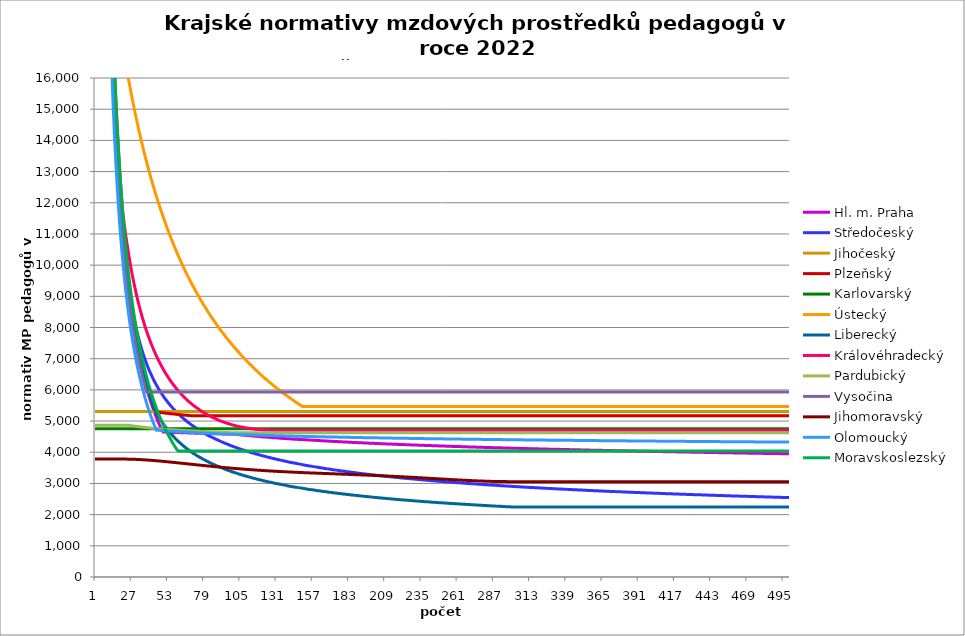
| Category | Hl. m. Praha | Středočeský | Jihočeský | Plzeňský | Karlovarský  | Ústecký   | Liberecký | Královéhradecký | Pardubický | Vysočina | Jihomoravský | Olomoucký | Moravskoslezský |
|---|---|---|---|---|---|---|---|---|---|---|---|---|---|
| 0 | 230520 | 235026 | 5305.814 | 235260 | 4750 | 207714 | 235200 | 244560 | 4866.689 | 32207.143 | 3780.621 | 211968 | 244200 |
| 1 | 115260 | 117513 | 5305.814 | 117630 | 4750 | 103857 | 117600 | 122280 | 4866.689 | 32207.143 | 3780.621 | 105984 | 122100 |
| 2 | 76840 | 78342 | 5305.814 | 78420 | 4750 | 69238 | 78400 | 81520 | 4866.689 | 32207.143 | 3780.621 | 70656 | 81400 |
| 3 | 57630 | 58756.5 | 5305.814 | 58815 | 4750 | 51928.5 | 58800 | 61140 | 4866.689 | 32207.143 | 3780.621 | 52992 | 61050 |
| 4 | 46104 | 47005.2 | 5305.814 | 47052 | 4750 | 41542.8 | 47040 | 48912 | 4866.689 | 32207.143 | 3780.621 | 42393.6 | 48840 |
| 5 | 38420 | 39171 | 5305.814 | 39210 | 4750 | 34619 | 39200 | 40760 | 4866.689 | 32207.143 | 3780.621 | 35328 | 40700 |
| 6 | 32931.429 | 33575.143 | 5305.814 | 33608.571 | 4750 | 29673.429 | 33600 | 34937.143 | 4866.689 | 32207.143 | 3780.621 | 30281.143 | 34885.714 |
| 7 | 28815 | 29378.25 | 5305.814 | 29407.5 | 4750 | 25964.25 | 29400 | 30570 | 4866.689 | 28181.25 | 3780.621 | 26496 | 30525 |
| 8 | 25613.333 | 26114 | 5305.814 | 26140 | 4750 | 23079.333 | 26133.333 | 27173.333 | 4866.689 | 25050 | 3780.621 | 23552 | 27133.333 |
| 9 | 23052 | 23502.6 | 5305.814 | 23526 | 4750 | 20771.4 | 23520 | 24456 | 4866.689 | 22545 | 3780.621 | 21196.8 | 24420 |
| 10 | 20956.364 | 21366 | 5305.814 | 21387.273 | 4750 | 20364.118 | 21381.818 | 22232.727 | 4866.689 | 20495.455 | 3780.621 | 19269.818 | 22200 |
| 11 | 19210 | 19585.5 | 5305.814 | 19605 | 4750 | 19972.5 | 19600 | 20380 | 4866.689 | 18787.5 | 3780.621 | 17664 | 20350 |
| 12 | 17732.308 | 18078.923 | 5305.814 | 18096.923 | 4750 | 19595.66 | 18092.308 | 18812.308 | 4866.689 | 17342.308 | 3780.621 | 16305.231 | 18784.615 |
| 13 | 16465.714 | 16787.571 | 5305.814 | 16804.286 | 4750 | 19232.778 | 16800 | 17468.571 | 4866.689 | 16103.571 | 3780.621 | 15140.571 | 17442.857 |
| 14 | 15368 | 15668.4 | 5305.814 | 15684 | 4750 | 18883.091 | 15680 | 16304 | 4866.689 | 15030 | 3780.621 | 14131.2 | 16280 |
| 15 | 14407.5 | 14689.125 | 5305.814 | 14703.75 | 4750 | 18545.893 | 14700 | 15285 | 4866.689 | 14090.625 | 3780.621 | 13248 | 15262.5 |
| 16 | 13560 | 13825.059 | 5305.814 | 13838.824 | 4750 | 18220.526 | 13835.294 | 14385.882 | 4866.689 | 13261.765 | 3780.621 | 12468.706 | 14364.706 |
| 17 | 12806.667 | 13057 | 5305.814 | 13070 | 4750 | 17906.379 | 13066.667 | 13586.667 | 4866.689 | 12525 | 3780.621 | 11776 | 13566.667 |
| 18 | 12132.632 | 12369.789 | 5305.814 | 12382.105 | 4750 | 17602.881 | 12378.947 | 12871.579 | 4866.689 | 11865.789 | 3780.621 | 11156.211 | 12852.632 |
| 19 | 11526 | 11807.992 | 5305.814 | 11763 | 4750 | 17309.5 | 11760 | 12228 | 4866.689 | 11272.5 | 3780.621 | 10598.4 | 12210 |
| 20 | 10977.143 | 11190.779 | 5305.814 | 11202.857 | 4750 | 17025.738 | 11200 | 11662.375 | 4866.689 | 10735.714 | 3780.621 | 10093.714 | 11628.571 |
| 21 | 10478.182 | 10659.522 | 5305.814 | 10693.636 | 4750 | 16751.129 | 10690.909 | 11309.133 | 4866.689 | 10247.727 | 3780.621 | 9634.909 | 11100 |
| 22 | 10022.609 | 10196.966 | 5305.814 | 10228.696 | 4750 | 16485.238 | 10226.087 | 10979.125 | 4866.689 | 9802.174 | 3780.306 | 9216 | 10617.391 |
| 23 | 9605 | 9790.216 | 5305.814 | 9802.5 | 4750 | 16227.656 | 9800 | 10674.814 | 4866.689 | 9393.75 | 3779.674 | 8832 | 10175 |
| 24 | 9220.8 | 9429.439 | 5305.814 | 9410.4 | 4750 | 15978 | 9408 | 10386.919 | 4866.689 | 9018 | 3779.043 | 8478.72 | 9768 |
| 25 | 8866.154 | 9107.003 | 5305.814 | 9048.462 | 4750 | 15735.909 | 9046.154 | 10120.422 | 4859.347 | 8671.154 | 3778.097 | 8152.615 | 9392.308 |
| 26 | 8537.778 | 8816.893 | 5305.814 | 8713.333 | 4750 | 15501.045 | 8711.111 | 9869.249 | 4852.43 | 8350 | 3776.836 | 7850.667 | 9044.444 |
| 27 | 8232.857 | 8554.301 | 5305.814 | 8402.143 | 4750 | 15273.088 | 8400 | 9634.036 | 4845.783 | 8051.786 | 3775.576 | 7570.286 | 8721.429 |
| 28 | 7948.966 | 8315.338 | 5305.814 | 8112.414 | 4750 | 15051.739 | 8110.345 | 9411.584 | 4839.386 | 7774.138 | 3774.002 | 7309.241 | 8420.69 |
| 29 | 7684 | 8096.823 | 5305.814 | 7842 | 4750 | 14836.714 | 7840 | 9204.366 | 4833.222 | 7515 | 3772.114 | 7065.6 | 8140 |
| 30 | 7436.129 | 7896.129 | 5305.814 | 7589.032 | 4750 | 14627.746 | 7587.097 | 9006.076 | 4827.276 | 7272.581 | 3770.229 | 6837.677 | 7877.419 |
| 31 | 7203.75 | 7711.065 | 5305.814 | 7351.875 | 4750 | 14424.583 | 7350 | 8820.92 | 4821.532 | 7045.312 | 3768.032 | 6624 | 7631.25 |
| 32 | 6985.455 | 7539.791 | 5305.814 | 7129.091 | 4750 | 14226.986 | 7127.273 | 8644.751 | 4815.978 | 6831.818 | 3765.837 | 6423.273 | 7400 |
| 33 | 6780 | 7380.749 | 5305.814 | 6919.412 | 4750 | 14034.73 | 6917.647 | 8476.95 | 4810.602 | 6630.882 | 3763.333 | 6234.353 | 7182.353 |
| 34 | 6586.286 | 7232.608 | 5305.814 | 6721.714 | 4750 | 13847.6 | 6720 | 8318.367 | 4805.393 | 6441.429 | 3760.831 | 6056.229 | 6977.143 |
| 35 | 6403.333 | 7094.23 | 5305.814 | 6535 | 4750 | 13665.395 | 6533.333 | 8168.337 | 4800.342 | 6262.5 | 3758.021 | 5888 | 6783.333 |
| 36 | 6230.27 | 6964.63 | 5305.814 | 6358.378 | 4750 | 13487.922 | 6356.757 | 8024.938 | 4795.439 | 6093.243 | 3755.214 | 5728.865 | 6600 |
| 37 | 6066.316 | 6842.955 | 5305.814 | 6191.053 | 4750 | 13315 | 6189.474 | 7889.032 | 4790.677 | 5932.895 | 3752.101 | 5578.105 | 6426.316 |
| 38 | 5910.769 | 6728.459 | 5305.814 | 6032.308 | 4750 | 13146.456 | 6030.769 | 7760.114 | 4786.047 | 5932.895 | 3748.994 | 5435.077 | 6261.538 |
| 39 | 5763 | 6620.49 | 5305.814 | 5881.5 | 4750 | 12982.125 | 5880 | 7636.534 | 4781.544 | 5932.895 | 3745.581 | 5299.2 | 6105 |
| 40 | 5622.439 | 6518.474 | 5305.814 | 5738.049 | 4750 | 12821.852 | 5736.585 | 7517.983 | 4777.159 | 5932.895 | 3742.174 | 5169.951 | 5956.098 |
| 41 | 5488.571 | 6421.902 | 5305.814 | 5601.429 | 4750 | 12665.488 | 5600 | 7405.299 | 4772.888 | 5932.895 | 3738.774 | 5046.857 | 5814.286 |
| 42 | 5360.93 | 6330.325 | 5305.814 | 5471.163 | 4750 | 12512.892 | 5469.767 | 7298.12 | 4768.725 | 5932.895 | 3735.072 | 4929.488 | 5679.07 |
| 43 | 5239.091 | 6243.341 | 5305.814 | 5346.818 | 4750 | 12363.929 | 5363.391 | 7195.057 | 4764.665 | 5932.895 | 3731.377 | 4817.455 | 5550 |
| 44 | 5122.667 | 6160.592 | 5305.814 | 5293.284 | 4750 | 12218.471 | 5277.689 | 7096.924 | 4760.703 | 5932.895 | 3727.689 | 4710.4 | 5426.667 |
| 45 | 5011.304 | 6081.756 | 5305.814 | 5287.336 | 4750 | 12076.395 | 5196.479 | 7002.434 | 4756.834 | 5932.895 | 3723.702 | 4706.739 | 5308.696 |
| 46 | 4904.681 | 6006.544 | 5305.814 | 5280.808 | 4750 | 11937.586 | 5119.399 | 6911.403 | 4753.054 | 5932.895 | 3719.724 | 4703.084 | 5195.745 |
| 47 | 4802.5 | 5934.697 | 5305.814 | 5274.888 | 4750 | 11801.932 | 5046.125 | 6824.613 | 4749.36 | 5932.895 | 3715.754 | 4699.435 | 5087.5 |
| 48 | 4704.49 | 5865.977 | 5305.814 | 5269.571 | 4750 | 11669.326 | 4976.367 | 6741.833 | 4745.747 | 5932.895 | 3711.488 | 4695.791 | 4983.673 |
| 49 | 4651.801 | 5800.173 | 5305.814 | 5263.676 | 4750 | 11539.667 | 4909.865 | 6661.945 | 4742.213 | 5932.895 | 3707.536 | 4692.153 | 4884 |
| 50 | 4649.924 | 5737.088 | 5305.814 | 5258.382 | 4750 | 11412.857 | 4846.381 | 6584.814 | 4738.754 | 5932.895 | 3703.289 | 4688.52 | 4788.235 |
| 51 | 4648.049 | 5676.547 | 5305.814 | 5253.098 | 4750 | 11288.804 | 4785.705 | 6511.182 | 4735.367 | 5932.895 | 3698.75 | 4685.411 | 4696.154 |
| 52 | 4646.176 | 5618.388 | 5305.814 | 5247.825 | 4750 | 11167.419 | 4727.643 | 6440.026 | 4732.049 | 5932.895 | 3694.523 | 4682.306 | 4607.547 |
| 53 | 4643.836 | 5562.464 | 5305.814 | 5242.563 | 4750 | 11048.617 | 4672.019 | 6372.069 | 4728.798 | 5932.895 | 3690.005 | 4678.689 | 4522.222 |
| 54 | 4641.965 | 5508.637 | 5305.814 | 5237.894 | 4750 | 10932.316 | 4618.675 | 6306.343 | 4725.611 | 5932.895 | 3685.498 | 4675.593 | 4440 |
| 55 | 4640.097 | 5456.785 | 5305.814 | 5232.651 | 4750 | 10818.437 | 4567.464 | 6243.554 | 4722.485 | 5932.895 | 3681.002 | 4672.501 | 4360.714 |
| 56 | 4638.696 | 5406.793 | 5305.814 | 5228 | 4750 | 10706.907 | 4518.254 | 6182.002 | 4719.419 | 5932.895 | 3676.517 | 4669.413 | 4284.211 |
| 57 | 4636.83 | 5358.554 | 5305.814 | 5223.357 | 4750 | 10597.653 | 4470.921 | 6123.951 | 4716.41 | 5932.895 | 3672.043 | 4666.843 | 4210.345 |
| 58 | 4634.965 | 5311.971 | 5305.814 | 5218.722 | 4750 | 10490.606 | 4425.354 | 6066.981 | 4713.456 | 5932.895 | 3667.282 | 4663.762 | 4138.983 |
| 59 | 4633.102 | 5266.954 | 5305.814 | 5214.096 | 4750 | 10385.7 | 4381.45 | 6012.538 | 4710.555 | 5932.895 | 3662.831 | 4660.686 | 4070 |
| 60 | 4631.706 | 5223.42 | 5305.814 | 5209.477 | 4750 | 10282.871 | 4339.113 | 5960.517 | 4707.706 | 5932.895 | 3658.094 | 4658.125 | 4040.705 |
| 61 | 4629.845 | 5181.289 | 5305.814 | 5204.867 | 4750 | 10182.059 | 4298.255 | 5910.101 | 4704.906 | 5932.895 | 3653.37 | 4655.057 | 4040.705 |
| 62 | 4628.451 | 5140.491 | 5305.814 | 5200.84 | 4750 | 10083.204 | 4258.795 | 5861.234 | 4702.155 | 5932.895 | 3648.658 | 4652.502 | 4040.705 |
| 63 | 4626.593 | 5100.959 | 5305.814 | 5196.245 | 4750 | 9986.25 | 4220.657 | 5813.86 | 4699.45 | 5932.895 | 3643.958 | 4649.951 | 4040.705 |
| 64 | 4625.201 | 5062.628 | 5305.814 | 5192.231 | 4750 | 9891.143 | 4183.772 | 5768.605 | 4696.79 | 5932.895 | 3639.27 | 4647.402 | 4040.705 |
| 65 | 4623.345 | 5025.442 | 5305.814 | 5188.224 | 4750 | 9797.83 | 4148.076 | 5724.719 | 4694.173 | 5932.895 | 3634.594 | 4644.347 | 4040.705 |
| 66 | 4621.955 | 4989.345 | 5305.814 | 5184.222 | 4750 | 9706.262 | 4113.506 | 5682.156 | 4691.599 | 5932.895 | 3629.93 | 4641.804 | 4040.705 |
| 67 | 4620.565 | 4954.286 | 5305.814 | 5180.227 | 4750 | 9616.389 | 4080.007 | 5641.522 | 4689.065 | 5932.895 | 3625.278 | 4639.772 | 4040.705 |
| 68 | 4618.714 | 4920.218 | 5305.814 | 5176.238 | 4750 | 9528.165 | 4047.527 | 5602.107 | 4686.572 | 5932.895 | 3620.638 | 4637.235 | 4040.705 |
| 69 | 4617.326 | 4887.095 | 5305.814 | 5172.255 | 4750 | 9441.545 | 4016.017 | 5563.872 | 4684.116 | 5932.895 | 3615.721 | 4634.7 | 4040.705 |
| 70 | 4615.939 | 4854.876 | 5305.814 | 5170.549 | 4750 | 9356.486 | 3985.429 | 5526.78 | 4681.699 | 5932.895 | 3611.106 | 4632.168 | 4040.705 |
| 71 | 4614.553 | 4823.521 | 5305.814 | 5170.549 | 4750 | 9272.946 | 3955.723 | 5491.411 | 4679.317 | 5932.895 | 3606.502 | 4629.639 | 4040.705 |
| 72 | 4613.168 | 4792.992 | 5305.814 | 5170.549 | 4750 | 9190.885 | 3926.857 | 5457.101 | 4676.97 | 5932.895 | 3601.623 | 4627.617 | 4040.705 |
| 73 | 4611.784 | 4763.255 | 5305.814 | 5170.549 | 4750 | 9110.263 | 3898.793 | 5423.819 | 4674.658 | 5932.895 | 3597.044 | 4625.093 | 4040.705 |
| 74 | 4610.4 | 4734.277 | 5305.814 | 5170.549 | 4750 | 9031.043 | 3871.497 | 5392.129 | 4672.379 | 5932.895 | 3592.476 | 4623.075 | 4040.705 |
| 75 | 4609.017 | 4706.026 | 5305.814 | 5170.549 | 4750 | 8953.19 | 3844.934 | 5360.807 | 4670.133 | 5932.895 | 3587.635 | 4620.556 | 4040.705 |
| 76 | 4607.635 | 4678.473 | 5305.814 | 5170.549 | 4750 | 8876.667 | 3819.073 | 5331.008 | 4667.918 | 5932.895 | 3583.091 | 4618.542 | 4040.705 |
| 77 | 4606.715 | 4651.59 | 5305.814 | 5170.549 | 4750 | 8801.441 | 3793.885 | 5302.114 | 4665.733 | 5932.895 | 3578.558 | 4616.531 | 4040.705 |
| 78 | 4605.334 | 4625.351 | 5305.814 | 5170.549 | 4750 | 8727.479 | 3769.341 | 5274.1 | 4663.579 | 5932.895 | 3574.037 | 4614.521 | 4040.705 |
| 79 | 4603.954 | 4599.731 | 5305.814 | 5170.549 | 4750 | 8654.75 | 3745.416 | 5247.506 | 4661.453 | 5932.895 | 3569.527 | 4612.01 | 4040.705 |
| 80 | 4602.576 | 4574.706 | 5305.814 | 5170.549 | 4750 | 8583.223 | 3722.085 | 5221.178 | 4659.356 | 5932.895 | 3565.028 | 4610.004 | 4040.705 |
| 81 | 4601.657 | 4550.254 | 5305.814 | 5170.549 | 4750 | 8512.869 | 3699.323 | 5196.218 | 4657.286 | 5932.895 | 3560.541 | 4608 | 4040.705 |
| 82 | 4600.279 | 4526.354 | 5305.814 | 5170.549 | 4750 | 8443.659 | 3677.109 | 5172.042 | 4655.243 | 5932.895 | 3556.065 | 4605.997 | 4040.705 |
| 83 | 4598.903 | 4502.985 | 5305.814 | 5170.549 | 4750 | 8375.565 | 3655.421 | 5148.632 | 4653.227 | 5932.895 | 3551.601 | 4603.997 | 4040.705 |
| 84 | 4597.985 | 4480.129 | 5305.814 | 5170.549 | 4750 | 8308.56 | 3634.24 | 5126.507 | 4651.236 | 5932.895 | 3547.147 | 4601.997 | 4040.705 |
| 85 | 4596.61 | 4457.767 | 5305.814 | 5170.549 | 4750 | 8242.619 | 3613.546 | 5104.571 | 4649.27 | 5932.895 | 3542.705 | 4600 | 4040.705 |
| 86 | 4595.694 | 4435.881 | 5305.814 | 5170.549 | 4750 | 8177.717 | 3593.322 | 5083.351 | 4647.328 | 5932.895 | 3538.551 | 4598.004 | 4040.705 |
| 87 | 4594.32 | 4414.456 | 5305.814 | 5170.549 | 4750 | 8113.828 | 3573.551 | 5063.354 | 4645.41 | 5932.895 | 3534.13 | 4596.509 | 4040.705 |
| 88 | 4592.947 | 4393.476 | 5305.814 | 5170.549 | 4750 | 8050.93 | 3554.215 | 5044.034 | 4643.516 | 5932.895 | 3529.995 | 4594.516 | 4040.705 |
| 89 | 4592.032 | 4372.925 | 5305.814 | 5170.549 | 4750 | 7989 | 3535.3 | 5024.861 | 4641.644 | 5932.895 | 3525.596 | 4592.525 | 4040.705 |
| 90 | 4591.117 | 4352.79 | 5305.814 | 5170.549 | 4750 | 7928.015 | 3516.792 | 5006.858 | 4639.794 | 5932.895 | 3521.481 | 4590.536 | 4040.705 |
| 91 | 4589.746 | 4333.056 | 5305.814 | 5170.549 | 4750 | 7867.955 | 3498.675 | 4989.493 | 4637.966 | 5932.895 | 3517.376 | 4589.045 | 4040.705 |
| 92 | 4588.832 | 4313.711 | 5305.814 | 5170.549 | 4750 | 7808.797 | 3480.937 | 4972.753 | 4636.159 | 5932.895 | 3513.281 | 4587.059 | 4040.705 |
| 93 | 4587.463 | 4294.741 | 5305.814 | 5170.549 | 4750 | 7750.522 | 3463.564 | 4956.627 | 4634.373 | 5932.895 | 3509.195 | 4585.571 | 4040.705 |
| 94 | 4586.55 | 4276.137 | 5305.814 | 5170.549 | 4750 | 7693.111 | 3446.545 | 4941.604 | 4632.607 | 5932.895 | 3505.119 | 4583.587 | 4040.705 |
| 95 | 4585.638 | 4257.884 | 5305.814 | 5170.549 | 4750 | 7636.544 | 3429.869 | 4926.672 | 4630.86 | 5932.895 | 3501.323 | 4582.101 | 4040.705 |
| 96 | 4584.726 | 4239.974 | 5305.814 | 5170.549 | 4750 | 7580.803 | 3413.523 | 4912.323 | 4629.134 | 5932.895 | 3497.265 | 4580.121 | 4040.705 |
| 97 | 4583.358 | 4222.396 | 5305.814 | 5170.549 | 4750 | 7525.87 | 3397.497 | 4898.548 | 4627.426 | 5932.895 | 3493.486 | 4578.637 | 4040.705 |
| 98 | 4582.447 | 4205.138 | 5305.814 | 5170.549 | 4750 | 7471.727 | 3381.782 | 4885.338 | 4625.737 | 5932.895 | 3489.446 | 4576.66 | 4040.705 |
| 99 | 4580.626 | 4188.193 | 5305.814 | 5170.549 | 4750 | 7418.357 | 3366.367 | 4873.169 | 4624.066 | 5932.895 | 3485.683 | 4575.178 | 4040.705 |
| 100 | 4576.079 | 4171.55 | 5305.814 | 5170.549 | 4750 | 7365.745 | 3351.244 | 4861.061 | 4624.066 | 5932.895 | 3481.929 | 4573.697 | 4040.705 |
| 101 | 4571.542 | 4155.201 | 5305.814 | 5170.549 | 4750 | 7313.873 | 3336.402 | 4849.494 | 4624.066 | 5932.895 | 3478.183 | 4571.724 | 4040.705 |
| 102 | 4567.013 | 4139.137 | 5305.814 | 5170.549 | 4750 | 7262.727 | 3321.835 | 4838.461 | 4624.066 | 5932.895 | 3474.712 | 4570.246 | 4040.705 |
| 103 | 4562.945 | 4123.35 | 5305.814 | 5170.549 | 4750 | 7212.292 | 3307.533 | 4827.954 | 4624.066 | 5932.895 | 3470.982 | 4568.768 | 4040.705 |
| 104 | 4558.434 | 4107.833 | 5305.814 | 5170.549 | 4750 | 7162.552 | 3293.489 | 4817.967 | 4624.066 | 5932.895 | 3467.525 | 4567.292 | 4040.705 |
| 105 | 4554.381 | 4092.577 | 5305.814 | 5170.549 | 4750 | 7113.493 | 3279.695 | 4808.967 | 4624.066 | 5932.895 | 3463.81 | 4565.816 | 4040.705 |
| 106 | 4549.887 | 4077.577 | 5305.814 | 5170.549 | 4750 | 7065.102 | 3266.144 | 4800 | 4624.066 | 5932.895 | 3460.367 | 4564.341 | 4040.705 |
| 107 | 4545.849 | 4062.823 | 5305.814 | 5170.549 | 4750 | 7017.365 | 3252.829 | 4791.536 | 4624.066 | 5932.895 | 3456.931 | 4562.376 | 4040.705 |
| 108 | 4541.819 | 4048.311 | 5305.814 | 5170.549 | 4750 | 6970.268 | 3239.743 | 4783.102 | 4624.066 | 5932.895 | 3453.502 | 4560.904 | 4040.705 |
| 109 | 4537.795 | 4034.033 | 5305.814 | 5170.549 | 4750 | 6923.8 | 3226.88 | 4775.63 | 4624.066 | 5932.895 | 3450.08 | 4559.432 | 4040.705 |
| 110 | 4533.333 | 4019.983 | 5305.814 | 5170.549 | 4750 | 6877.947 | 3214.234 | 4768.646 | 4624.066 | 5932.895 | 3446.927 | 4557.962 | 4040.705 |
| 111 | 4529.77 | 4006.155 | 5305.814 | 5170.549 | 4750 | 6832.697 | 3201.799 | 4761.682 | 4624.066 | 5932.895 | 3443.518 | 4556.492 | 4040.705 |
| 112 | 4525.768 | 3992.544 | 5305.814 | 5170.549 | 4750 | 6788.039 | 3189.569 | 4755.664 | 4624.066 | 5932.895 | 3440.377 | 4555.023 | 4040.705 |
| 113 | 4521.773 | 3979.144 | 5305.814 | 5170.549 | 4750 | 6743.961 | 3177.539 | 4749.66 | 4624.066 | 5932.895 | 3437.242 | 4553.555 | 4040.705 |
| 114 | 4517.785 | 3965.949 | 5305.814 | 5170.549 | 4750 | 6700.452 | 3165.703 | 4744.132 | 4624.066 | 5932.895 | 3434.112 | 4552.577 | 4040.705 |
| 115 | 4513.805 | 3952.955 | 5305.814 | 5170.549 | 4750 | 6657.5 | 3154.056 | 4739.076 | 4624.066 | 5932.895 | 3430.988 | 4551.111 | 4040.705 |
| 116 | 4510.272 | 3940.156 | 5305.814 | 5170.549 | 4750 | 6615.096 | 3142.593 | 4734.488 | 4624.066 | 5932.895 | 3427.87 | 4549.646 | 4040.705 |
| 117 | 4506.304 | 3927.547 | 5305.814 | 5170.549 | 4750 | 6573.228 | 3131.31 | 4730.368 | 4624.066 | 5932.895 | 3424.758 | 4548.182 | 4040.705 |
| 118 | 4502.783 | 3915.124 | 5305.814 | 5170.549 | 4750 | 6531.887 | 3120.202 | 4726.71 | 4624.066 | 5932.895 | 3421.91 | 4546.718 | 4040.705 |
| 119 | 4499.268 | 3902.883 | 5305.814 | 5170.549 | 4750 | 6491.062 | 3109.265 | 4723.059 | 4624.066 | 5932.895 | 3419.066 | 4545.256 | 4040.705 |
| 120 | 4495.32 | 3890.818 | 5305.814 | 5170.549 | 4750 | 6450.745 | 3098.493 | 4719.869 | 4624.066 | 5932.895 | 3416.228 | 4544.281 | 4040.705 |
| 121 | 4491.816 | 3878.927 | 5305.814 | 5170.549 | 4750 | 6410.926 | 3087.884 | 4717.138 | 4624.066 | 5932.895 | 3413.394 | 4542.82 | 4040.705 |
| 122 | 4488.318 | 3867.204 | 5305.814 | 5170.549 | 4750 | 6371.595 | 3077.433 | 4714.864 | 4624.066 | 5932.895 | 3410.564 | 4541.36 | 4040.705 |
| 123 | 4484.825 | 3855.645 | 5305.814 | 5170.549 | 4750 | 6332.744 | 3067.136 | 4713.047 | 4624.066 | 5932.895 | 3407.74 | 4539.901 | 4040.705 |
| 124 | 4481.337 | 3844.248 | 5305.814 | 5170.549 | 4750 | 6294.364 | 3056.989 | 4711.231 | 4624.066 | 5932.895 | 3404.92 | 4538.929 | 4040.705 |
| 125 | 4477.855 | 3833.007 | 5305.814 | 5170.549 | 4750 | 6256.446 | 3046.99 | 4709.87 | 4624.066 | 5932.895 | 3402.36 | 4537.472 | 4040.705 |
| 126 | 4474.379 | 3821.921 | 5305.814 | 5170.549 | 4750 | 6218.982 | 3037.134 | 4708.963 | 4624.066 | 5932.895 | 3399.549 | 4536.015 | 4040.705 |
| 127 | 4470.908 | 3810.984 | 5305.814 | 5170.549 | 4750 | 6181.964 | 3027.418 | 4708.51 | 4624.066 | 5932.895 | 3396.998 | 4535.045 | 4040.705 |
| 128 | 4467.442 | 3800.195 | 5305.814 | 5170.549 | 4750 | 6145.385 | 3017.839 | 4708.057 | 4624.066 | 5932.895 | 3394.45 | 4533.59 | 4040.705 |
| 129 | 4463.981 | 3789.549 | 5305.814 | 5170.549 | 4750 | 6109.235 | 3008.394 | 4708.057 | 4624.066 | 5932.895 | 3391.906 | 4532.621 | 4040.705 |
| 130 | 4460.958 | 3779.043 | 5305.814 | 5170.549 | 4750 | 6073.509 | 2999.08 | 4708.057 | 4624.066 | 5932.895 | 3389.366 | 4531.167 | 4040.705 |
| 131 | 4457.507 | 3768.674 | 5305.814 | 5170.549 | 4750 | 6038.198 | 2989.893 | 4708.057 | 4624.066 | 5932.895 | 3387.084 | 4530.199 | 4040.705 |
| 132 | 4454.493 | 3758.44 | 5305.814 | 5170.549 | 4750 | 6003.295 | 2980.831 | 4708.057 | 4624.066 | 5932.895 | 3384.551 | 4528.747 | 4040.705 |
| 133 | 4451.052 | 3748.338 | 5305.814 | 5170.549 | 4750 | 5968.793 | 2971.891 | 4708.057 | 4624.066 | 5932.895 | 3382.275 | 4527.78 | 4040.705 |
| 134 | 4448.046 | 3738.364 | 5305.814 | 5170.549 | 4750 | 5934.686 | 2963.07 | 4708.057 | 4624.066 | 5932.895 | 3379.749 | 4526.329 | 4040.705 |
| 135 | 4444.616 | 3728.516 | 5305.814 | 5170.549 | 4750 | 5900.966 | 2954.366 | 4708.057 | 4624.066 | 5932.895 | 3377.479 | 4525.363 | 4040.705 |
| 136 | 4441.618 | 3718.791 | 5305.814 | 5170.549 | 4750 | 5867.627 | 2945.776 | 4708.057 | 4624.066 | 5932.895 | 3375.213 | 4523.914 | 4040.705 |
| 137 | 4438.625 | 3709.187 | 5305.814 | 5170.549 | 4750 | 5834.663 | 2937.298 | 4708.057 | 4624.066 | 5932.895 | 3372.949 | 4522.949 | 4040.705 |
| 138 | 4435.636 | 3699.702 | 5305.814 | 5170.549 | 4750 | 5802.067 | 2928.929 | 4708.057 | 4624.066 | 5932.895 | 3370.688 | 4521.502 | 4040.705 |
| 139 | 4432.225 | 3690.332 | 5305.814 | 5170.549 | 4750 | 5769.833 | 2920.668 | 4708.057 | 4624.066 | 5932.895 | 3368.681 | 4520.537 | 4040.705 |
| 140 | 4429.244 | 3681.076 | 5305.814 | 5170.549 | 4750 | 5737.956 | 2912.511 | 4708.057 | 4624.066 | 5932.895 | 3366.426 | 4519.574 | 4040.705 |
| 141 | 4426.267 | 3671.931 | 5305.814 | 5170.549 | 4750 | 5706.429 | 2904.456 | 4708.057 | 4624.066 | 5932.895 | 3364.174 | 4518.129 | 4040.705 |
| 142 | 4423.295 | 3662.895 | 5305.814 | 5170.549 | 4750 | 5675.246 | 2896.503 | 4708.057 | 4624.066 | 5932.895 | 3362.175 | 4517.166 | 4040.705 |
| 143 | 4420.326 | 3653.966 | 5305.814 | 5170.549 | 4750 | 5644.402 | 2888.647 | 4708.057 | 4624.066 | 5932.895 | 3360.178 | 4516.203 | 4040.705 |
| 144 | 4417.361 | 3645.142 | 5305.814 | 5170.549 | 4750 | 5613.892 | 2880.888 | 4708.057 | 4624.066 | 5932.895 | 3357.935 | 4514.76 | 4040.705 |
| 145 | 4414.401 | 3636.42 | 5305.814 | 5170.549 | 4750 | 5583.71 | 2873.224 | 4708.057 | 4624.066 | 5932.895 | 3355.943 | 4513.799 | 4040.705 |
| 146 | 4411.866 | 3627.799 | 5305.814 | 5170.549 | 4750 | 5553.85 | 2865.652 | 4708.057 | 4624.066 | 5932.895 | 3353.953 | 4512.838 | 4040.705 |
| 147 | 4408.913 | 3619.277 | 5305.814 | 5170.549 | 4750 | 5524.309 | 2858.171 | 4708.057 | 4624.066 | 5932.895 | 3351.966 | 4511.877 | 4040.705 |
| 148 | 4405.963 | 3610.852 | 5305.814 | 5170.549 | 4750 | 5495.079 | 2850.778 | 4708.057 | 4624.066 | 5932.895 | 3349.981 | 4510.437 | 4040.705 |
| 149 | 4405.121 | 3602.522 | 5305.814 | 5170.549 | 4750 | 5466.158 | 2843.473 | 4708.057 | 4624.066 | 5932.895 | 3347.999 | 4509.478 | 4040.705 |
| 150 | 4402.597 | 3594.285 | 5305.814 | 5170.549 | 4750 | 5466.158 | 2836.254 | 4708.057 | 4624.066 | 5932.895 | 3346.019 | 4508.519 | 4040.705 |
| 151 | 4399.656 | 3586.14 | 5305.814 | 5170.549 | 4750 | 5466.158 | 2829.118 | 4708.057 | 4624.066 | 5932.895 | 3344.288 | 4507.56 | 4040.705 |
| 152 | 4397.139 | 3578.085 | 5305.814 | 5170.549 | 4750 | 5466.158 | 2822.065 | 4708.057 | 4624.066 | 5932.895 | 3342.313 | 4506.122 | 4040.705 |
| 153 | 4394.205 | 3570.118 | 5305.814 | 5170.549 | 4750 | 5466.158 | 2815.092 | 4708.057 | 4624.066 | 5932.895 | 3340.586 | 4505.165 | 4040.705 |
| 154 | 4391.694 | 3562.238 | 5305.814 | 5170.549 | 4750 | 5466.158 | 2808.198 | 4708.057 | 4624.066 | 5932.895 | 3338.615 | 4504.207 | 4040.705 |
| 155 | 4388.767 | 3554.443 | 5305.814 | 5170.549 | 4750 | 5466.158 | 2801.383 | 4708.057 | 4624.066 | 5932.895 | 3336.892 | 4503.25 | 4040.705 |
| 156 | 4386.262 | 3546.731 | 5305.814 | 5170.549 | 4750 | 5466.158 | 2794.643 | 4708.057 | 4624.066 | 5932.895 | 3334.925 | 4502.294 | 4040.705 |
| 157 | 4383.343 | 3539.101 | 5305.814 | 5170.549 | 4750 | 5466.158 | 2787.978 | 4708.057 | 4624.066 | 5932.895 | 3333.206 | 4501.338 | 4040.705 |
| 158 | 4380.844 | 3531.552 | 5305.814 | 5170.549 | 4750 | 5466.158 | 2781.387 | 4708.057 | 4624.066 | 5932.895 | 3331.488 | 4500.382 | 4040.705 |
| 159 | 4378.348 | 3524.082 | 5305.814 | 5170.549 | 4750 | 5466.158 | 2774.868 | 4708.057 | 4624.066 | 5932.895 | 3329.528 | 4499.427 | 4040.705 |
| 160 | 4375.854 | 3516.69 | 5305.814 | 5170.549 | 4750 | 5466.158 | 2768.419 | 4708.057 | 4624.066 | 5932.895 | 3327.814 | 4497.995 | 4040.705 |
| 161 | 4372.949 | 3509.374 | 5305.814 | 5170.549 | 4750 | 5466.158 | 2762.04 | 4708.057 | 4624.066 | 5932.895 | 3326.102 | 4497.04 | 4040.705 |
| 162 | 4370.462 | 3502.133 | 5305.814 | 5170.549 | 4750 | 5466.158 | 2755.73 | 4708.057 | 4624.066 | 5932.895 | 3324.392 | 4496.087 | 4040.705 |
| 163 | 4367.977 | 3494.967 | 5305.814 | 5170.549 | 4750 | 5466.158 | 2749.487 | 4708.057 | 4624.066 | 5932.895 | 3322.684 | 4495.133 | 4040.705 |
| 164 | 4365.496 | 3487.872 | 5305.814 | 5170.549 | 4750 | 5466.158 | 2743.309 | 4708.057 | 4624.066 | 5932.895 | 3320.977 | 4494.18 | 4040.705 |
| 165 | 4363.017 | 3480.849 | 5305.814 | 5170.549 | 4750 | 5466.158 | 2737.196 | 4708.057 | 4624.066 | 5932.895 | 3319.273 | 4493.227 | 4040.705 |
| 166 | 4360.541 | 3473.897 | 5305.814 | 5170.549 | 4750 | 5466.158 | 2731.147 | 4708.057 | 4624.066 | 5932.895 | 3317.569 | 4492.275 | 4040.705 |
| 167 | 4358.068 | 3467.013 | 5305.814 | 5170.549 | 4750 | 5466.158 | 2725.161 | 4708.057 | 4624.066 | 5932.895 | 3315.868 | 4491.323 | 4040.705 |
| 168 | 4355.598 | 3460.197 | 5305.814 | 5170.549 | 4750 | 5466.158 | 2719.236 | 4708.057 | 4624.066 | 5932.895 | 3314.169 | 4490.372 | 4040.705 |
| 169 | 4353.13 | 3453.448 | 5305.814 | 5170.549 | 4750 | 5466.158 | 2713.371 | 4708.057 | 4624.066 | 5932.895 | 3312.471 | 4489.421 | 4040.705 |
| 170 | 4350.665 | 3446.764 | 5305.814 | 5170.549 | 4750 | 5466.158 | 2707.566 | 4708.057 | 4624.066 | 5932.895 | 3310.775 | 4488.47 | 4040.705 |
| 171 | 4348.613 | 3440.145 | 5305.814 | 5170.549 | 4750 | 5466.158 | 2701.819 | 4708.057 | 4624.066 | 5932.895 | 3309.08 | 4487.52 | 4040.705 |
| 172 | 4346.154 | 3433.59 | 5305.814 | 5170.549 | 4750 | 5466.158 | 2696.13 | 4708.057 | 4624.066 | 5932.895 | 3307.388 | 4487.045 | 4040.705 |
| 173 | 4343.697 | 3427.097 | 5305.814 | 5170.549 | 4750 | 5466.158 | 2690.497 | 4708.057 | 4624.066 | 5932.895 | 3305.697 | 4486.095 | 4040.705 |
| 174 | 4341.243 | 3420.665 | 5305.814 | 5170.549 | 4750 | 5466.158 | 2684.92 | 4708.057 | 4624.066 | 5932.895 | 3304.008 | 4485.146 | 4040.705 |
| 175 | 4339.2 | 3414.294 | 5305.814 | 5170.549 | 4750 | 5466.158 | 2679.397 | 4708.057 | 4624.066 | 5932.895 | 3302.32 | 4484.197 | 4040.705 |
| 176 | 4336.751 | 3407.983 | 5305.814 | 5170.549 | 4750 | 5466.158 | 2673.929 | 4708.057 | 4624.066 | 5932.895 | 3300.394 | 4483.249 | 4040.705 |
| 177 | 4334.305 | 3401.73 | 5305.814 | 5170.549 | 4750 | 5466.158 | 2668.513 | 4708.057 | 4624.066 | 5932.895 | 3298.71 | 4482.301 | 4040.705 |
| 178 | 4332.268 | 3395.536 | 5305.814 | 5170.549 | 4750 | 5466.158 | 2663.149 | 4708.057 | 4624.066 | 5932.895 | 3297.028 | 4481.353 | 4040.705 |
| 179 | 4329.827 | 3389.397 | 5305.814 | 5170.549 | 4750 | 5466.158 | 2657.836 | 4708.057 | 4624.066 | 5932.895 | 3295.348 | 4480.406 | 4040.705 |
| 180 | 4327.795 | 3383.315 | 5305.814 | 5170.549 | 4750 | 5466.158 | 2652.574 | 4708.057 | 4624.066 | 5932.895 | 3293.669 | 4479.459 | 4040.705 |
| 181 | 4325.359 | 3377.288 | 5305.814 | 5170.549 | 4750 | 5466.158 | 2647.361 | 4708.057 | 4624.066 | 5932.895 | 3291.992 | 4478.986 | 4040.705 |
| 182 | 4323.331 | 3371.316 | 5305.814 | 5170.549 | 4750 | 5466.158 | 2642.198 | 4708.057 | 4624.066 | 5932.895 | 3290.317 | 4478.04 | 4040.705 |
| 183 | 4320.9 | 3365.396 | 5305.814 | 5170.549 | 4750 | 5466.158 | 2637.082 | 4708.057 | 4624.066 | 5932.895 | 3288.643 | 4477.094 | 4040.705 |
| 184 | 4318.876 | 3359.53 | 5305.814 | 5170.549 | 4750 | 5466.158 | 2632.014 | 4708.057 | 4624.066 | 5932.895 | 3286.733 | 4476.148 | 4040.705 |
| 185 | 4316.45 | 3353.715 | 5305.814 | 5170.549 | 4750 | 5466.158 | 2626.992 | 4708.057 | 4624.066 | 5932.895 | 3285.063 | 4475.203 | 4040.705 |
| 186 | 4314.43 | 3347.951 | 5305.814 | 5170.549 | 4750 | 5466.158 | 2622.016 | 4708.057 | 4624.066 | 5932.895 | 3283.395 | 4474.731 | 4040.705 |
| 187 | 4312.412 | 3342.238 | 5305.814 | 5170.549 | 4750 | 5466.158 | 2617.085 | 4708.057 | 4624.066 | 5932.895 | 3281.491 | 4473.786 | 4040.705 |
| 188 | 4309.993 | 3336.575 | 5305.814 | 5170.549 | 4750 | 5466.158 | 2612.199 | 4708.057 | 4624.066 | 5932.895 | 3279.826 | 4472.842 | 4040.705 |
| 189 | 4307.98 | 3330.96 | 5305.814 | 5170.549 | 4750 | 5466.158 | 2607.357 | 4708.057 | 4624.066 | 5932.895 | 3277.926 | 4471.899 | 4040.705 |
| 190 | 4305.968 | 3325.393 | 5305.814 | 5170.549 | 4750 | 5466.158 | 2602.558 | 4708.057 | 4624.066 | 5932.895 | 3276.265 | 4471.427 | 4040.705 |
| 191 | 4303.958 | 3319.874 | 5305.814 | 5170.549 | 4750 | 5466.158 | 2597.801 | 4708.057 | 4624.066 | 5932.895 | 3274.369 | 4470.484 | 4040.705 |
| 192 | 4301.549 | 3314.402 | 5305.814 | 5170.549 | 4750 | 5466.158 | 2593.087 | 4708.057 | 4624.066 | 5932.895 | 3272.475 | 4469.541 | 4040.705 |
| 193 | 4299.543 | 3308.976 | 5305.814 | 5170.549 | 4750 | 5466.158 | 2588.414 | 4708.057 | 4624.066 | 5932.895 | 3270.819 | 4468.599 | 4040.705 |
| 194 | 4297.539 | 3303.595 | 5305.814 | 5170.549 | 4750 | 5466.158 | 2583.781 | 4708.057 | 4624.066 | 5932.895 | 3268.93 | 4468.128 | 4040.705 |
| 195 | 4295.537 | 3298.26 | 5305.814 | 5170.549 | 4750 | 5466.158 | 2579.189 | 4708.057 | 4624.066 | 5932.895 | 3267.042 | 4467.187 | 4040.705 |
| 196 | 4293.537 | 3292.968 | 5305.814 | 5170.549 | 4750 | 5466.158 | 2574.636 | 4708.057 | 4624.066 | 5932.895 | 3265.157 | 4466.245 | 4040.705 |
| 197 | 4291.539 | 3287.72 | 5305.814 | 5170.549 | 4750 | 5466.158 | 2570.122 | 4708.057 | 4624.066 | 5932.895 | 3263.273 | 4465.775 | 4040.705 |
| 198 | 4289.542 | 3282.515 | 5305.814 | 5170.549 | 4750 | 5466.158 | 2565.646 | 4708.057 | 4624.066 | 5932.895 | 3261.392 | 4464.834 | 4040.705 |
| 199 | 4287.548 | 3277.353 | 5305.814 | 5170.549 | 4750 | 5466.158 | 2561.209 | 4708.057 | 4624.066 | 5932.895 | 3259.513 | 4463.894 | 4040.705 |
| 200 | 4285.555 | 3272.232 | 5305.814 | 5170.549 | 4750 | 5466.158 | 2556.808 | 4708.057 | 4624.066 | 5932.895 | 3257.402 | 4463.424 | 4040.705 |
| 201 | 4283.564 | 3267.153 | 5305.814 | 5170.549 | 4750 | 5466.158 | 2552.445 | 4708.057 | 4624.066 | 5932.895 | 3255.528 | 4462.484 | 4040.705 |
| 202 | 4281.575 | 3262.114 | 5305.814 | 5170.549 | 4750 | 5466.158 | 2548.118 | 4708.057 | 4624.066 | 5932.895 | 3253.422 | 4461.545 | 4040.705 |
| 203 | 4279.588 | 3257.116 | 5305.814 | 5170.549 | 4750 | 5466.158 | 2543.827 | 4708.057 | 4624.066 | 5932.895 | 3251.552 | 4461.075 | 4040.705 |
| 204 | 4277.603 | 3252.157 | 5305.814 | 5170.549 | 4750 | 5466.158 | 2539.571 | 4708.057 | 4624.066 | 5932.895 | 3249.451 | 4460.137 | 4040.705 |
| 205 | 4275.619 | 3247.237 | 5305.814 | 5170.549 | 4750 | 5466.158 | 2535.349 | 4708.057 | 4624.066 | 5932.895 | 3247.586 | 4459.198 | 4040.705 |
| 206 | 4273.637 | 3242.356 | 5305.814 | 5170.549 | 4750 | 5466.158 | 2531.162 | 4708.057 | 4624.066 | 5932.895 | 3245.49 | 4458.729 | 4040.705 |
| 207 | 4271.658 | 3237.513 | 5305.814 | 5170.549 | 4750 | 5466.158 | 2527.009 | 4708.057 | 4624.066 | 5932.895 | 3243.397 | 4457.792 | 4040.705 |
| 208 | 4270.075 | 3232.708 | 5305.814 | 5170.549 | 4750 | 5466.158 | 2522.89 | 4708.057 | 4624.066 | 5932.895 | 3241.306 | 4457.323 | 4040.705 |
| 209 | 4268.099 | 3227.939 | 5305.814 | 5170.549 | 4750 | 5466.158 | 2518.803 | 4708.057 | 4624.066 | 5932.895 | 3239.218 | 4456.386 | 4040.705 |
| 210 | 4266.124 | 3223.207 | 5305.814 | 5170.549 | 4750 | 5466.158 | 2514.749 | 4708.057 | 4624.066 | 5932.895 | 3237.133 | 4455.449 | 4040.705 |
| 211 | 4264.151 | 3218.512 | 5305.814 | 5170.549 | 4750 | 5466.158 | 2510.727 | 4708.057 | 4624.066 | 5932.895 | 3234.82 | 4454.981 | 4040.705 |
| 212 | 4262.574 | 3213.852 | 5305.814 | 5170.549 | 4750 | 5466.158 | 2506.737 | 4708.057 | 4624.066 | 5932.895 | 3232.741 | 4454.045 | 4040.705 |
| 213 | 4260.604 | 3209.227 | 5305.814 | 5170.549 | 4750 | 5466.158 | 2502.778 | 4708.057 | 4624.066 | 5932.895 | 3230.664 | 4453.577 | 4040.705 |
| 214 | 4258.637 | 3204.637 | 5305.814 | 5170.549 | 4750 | 5466.158 | 2498.85 | 4708.057 | 4624.066 | 5932.895 | 3228.359 | 4452.642 | 4040.705 |
| 215 | 4257.064 | 3200.081 | 5305.814 | 5170.549 | 4750 | 5466.158 | 2494.952 | 4708.057 | 4624.066 | 5932.895 | 3226.058 | 4452.174 | 4040.705 |
| 216 | 4255.099 | 3195.559 | 5305.814 | 5170.549 | 4750 | 5466.158 | 2491.085 | 4708.057 | 4624.066 | 5932.895 | 3223.99 | 4451.239 | 4040.705 |
| 217 | 4253.529 | 3191.071 | 5305.814 | 5170.549 | 4750 | 5466.158 | 2487.247 | 4708.057 | 4624.066 | 5932.895 | 3221.695 | 4450.772 | 4040.705 |
| 218 | 4251.568 | 3186.615 | 5305.814 | 5170.549 | 4750 | 5466.158 | 2483.438 | 4708.057 | 4624.066 | 5932.895 | 3219.404 | 4449.837 | 4040.705 |
| 219 | 4249.608 | 3182.193 | 5305.814 | 5170.549 | 4750 | 5466.158 | 2479.658 | 4708.057 | 4624.066 | 5932.895 | 3217.116 | 4448.903 | 4040.705 |
| 220 | 4248.042 | 3177.802 | 5305.814 | 5170.549 | 4750 | 5466.158 | 2475.907 | 4708.057 | 4624.066 | 5932.895 | 3214.831 | 4448.437 | 4040.705 |
| 221 | 4246.086 | 3173.444 | 5305.814 | 5170.549 | 4750 | 5466.158 | 2472.184 | 4708.057 | 4624.066 | 5932.895 | 3212.549 | 4447.503 | 4040.705 |
| 222 | 4244.522 | 3169.116 | 5305.814 | 5170.549 | 4750 | 5466.158 | 2468.489 | 4708.057 | 4624.066 | 5932.895 | 3210.043 | 4447.037 | 4040.705 |
| 223 | 4242.569 | 3164.82 | 5305.814 | 5170.549 | 4750 | 5466.158 | 2464.821 | 4708.057 | 4624.066 | 5932.895 | 3207.768 | 4446.104 | 4040.705 |
| 224 | 4241.008 | 3160.555 | 5305.814 | 5170.549 | 4750 | 5466.158 | 2461.181 | 4708.057 | 4624.066 | 5932.895 | 3205.269 | 4445.638 | 4040.705 |
| 225 | 4239.058 | 3156.32 | 5305.814 | 5170.549 | 4750 | 5466.158 | 2457.567 | 4708.057 | 4624.066 | 5932.895 | 3203 | 4445.171 | 4040.705 |
| 226 | 4237.5 | 3152.115 | 5305.814 | 5170.549 | 4750 | 5466.158 | 2453.98 | 4708.057 | 4624.066 | 5932.895 | 3200.509 | 4444.239 | 4040.705 |
| 227 | 4235.943 | 3147.939 | 5305.814 | 5170.549 | 4750 | 5466.158 | 2450.419 | 4708.057 | 4624.066 | 5932.895 | 3198.022 | 4443.774 | 4040.705 |
| 228 | 4233.998 | 3143.793 | 5305.814 | 5170.549 | 4750 | 5466.158 | 2446.884 | 4708.057 | 4624.066 | 5932.895 | 3195.764 | 4442.842 | 4040.705 |
| 229 | 4232.443 | 3139.675 | 5305.814 | 5170.549 | 4750 | 5466.158 | 2443.374 | 4708.057 | 4624.066 | 5932.895 | 3193.283 | 4442.377 | 4040.705 |
| 230 | 4230.889 | 3135.586 | 5305.814 | 5170.549 | 4750 | 5466.158 | 2439.89 | 4708.057 | 4624.066 | 5932.895 | 3190.807 | 4441.446 | 4040.705 |
| 231 | 4228.949 | 3131.526 | 5305.814 | 5170.549 | 4750 | 5466.158 | 2436.43 | 4708.057 | 4624.066 | 5932.895 | 3188.335 | 4440.981 | 4040.705 |
| 232 | 4227.398 | 3127.493 | 5305.814 | 5170.549 | 4750 | 5466.158 | 2432.995 | 4708.057 | 4624.066 | 5932.895 | 3185.866 | 4440.05 | 4040.705 |
| 233 | 4225.848 | 3123.488 | 5305.814 | 5170.549 | 4750 | 5466.158 | 2429.584 | 4708.057 | 4624.066 | 5932.895 | 3183.177 | 4439.585 | 4040.705 |
| 234 | 4223.912 | 3119.51 | 5305.814 | 5170.549 | 4750 | 5466.158 | 2426.198 | 4708.057 | 4624.066 | 5932.895 | 3180.717 | 4439.12 | 4040.705 |
| 235 | 4222.365 | 3115.559 | 5305.814 | 5170.549 | 4750 | 5466.158 | 2422.835 | 4708.057 | 4624.066 | 5932.895 | 3178.26 | 4438.191 | 4040.705 |
| 236 | 4220.818 | 3111.635 | 5305.814 | 5170.549 | 4750 | 5466.158 | 2419.495 | 4708.057 | 4624.066 | 5932.895 | 3175.584 | 4437.726 | 4040.705 |
| 237 | 4219.273 | 3107.737 | 5305.814 | 5170.549 | 4750 | 5466.158 | 2416.179 | 4708.057 | 4624.066 | 5932.895 | 3173.135 | 4436.797 | 4040.705 |
| 238 | 4217.729 | 3103.865 | 5305.814 | 5170.549 | 4750 | 5466.158 | 2412.886 | 4708.057 | 4624.066 | 5932.895 | 3170.468 | 4436.333 | 4040.705 |
| 239 | 4215.801 | 3100.019 | 5305.814 | 5170.549 | 4750 | 5466.158 | 2409.615 | 4708.057 | 4624.066 | 5932.895 | 3168.027 | 4435.405 | 4040.705 |
| 240 | 4214.26 | 3096.198 | 5305.814 | 5170.549 | 4750 | 5466.158 | 2406.367 | 4708.057 | 4624.066 | 5932.895 | 3165.368 | 4434.941 | 4040.705 |
| 241 | 4212.719 | 3092.403 | 5305.814 | 5170.549 | 4750 | 5466.158 | 2403.141 | 4708.057 | 4624.066 | 5932.895 | 3162.714 | 4434.477 | 4040.705 |
| 242 | 4211.18 | 3088.632 | 5305.814 | 5170.549 | 4750 | 5466.158 | 2399.937 | 4708.057 | 4624.066 | 5932.895 | 3160.285 | 4433.549 | 4040.705 |
| 243 | 4209.642 | 3084.886 | 5305.814 | 5170.549 | 4750 | 5466.158 | 2396.754 | 4708.057 | 4624.066 | 5932.895 | 3157.639 | 4433.086 | 4040.705 |
| 244 | 4208.105 | 3081.164 | 5305.814 | 5170.549 | 4750 | 5466.158 | 2393.593 | 4708.057 | 4624.066 | 5932.895 | 3154.998 | 4432.622 | 4040.705 |
| 245 | 4206.569 | 3077.467 | 5305.814 | 5170.549 | 4750 | 5466.158 | 2390.453 | 4708.057 | 4624.066 | 5932.895 | 3152.361 | 4431.696 | 4040.705 |
| 246 | 4205.035 | 3073.793 | 5305.814 | 5170.549 | 4750 | 5466.158 | 2387.334 | 4708.057 | 4624.066 | 5932.895 | 3149.729 | 4431.232 | 4040.705 |
| 247 | 4203.501 | 3070.143 | 5305.814 | 5170.549 | 4750 | 5466.158 | 2384.236 | 4708.057 | 4624.066 | 5932.895 | 3147.101 | 4430.769 | 4040.705 |
| 248 | 4201.969 | 3066.516 | 5305.814 | 5170.549 | 4750 | 5466.158 | 2381.158 | 4708.057 | 4624.066 | 5932.895 | 3144.695 | 4429.843 | 4040.705 |
| 249 | 4200.437 | 3062.912 | 5305.814 | 5170.549 | 4750 | 5466.158 | 2378.1 | 4708.057 | 4624.066 | 5932.895 | 3142.076 | 4429.38 | 4040.705 |
| 250 | 4198.907 | 3059.33 | 5305.814 | 5170.549 | 4750 | 5466.158 | 2375.062 | 4708.057 | 4624.066 | 5932.895 | 3139.46 | 4428.918 | 4040.705 |
| 251 | 4197.378 | 3055.772 | 5305.814 | 5170.549 | 4750 | 5466.158 | 2372.044 | 4708.057 | 4624.066 | 5932.895 | 3136.849 | 4427.992 | 4040.705 |
| 252 | 4195.85 | 3052.236 | 5305.814 | 5170.549 | 4750 | 5466.158 | 2369.046 | 4708.057 | 4624.066 | 5932.895 | 3134.243 | 4427.53 | 4040.705 |
| 253 | 4194.323 | 3048.721 | 5305.814 | 5170.549 | 4750 | 5466.158 | 2366.067 | 4708.057 | 4624.066 | 5932.895 | 3131.64 | 4427.068 | 4040.705 |
| 254 | 4192.797 | 3045.229 | 5305.814 | 5170.549 | 4750 | 5466.158 | 2363.107 | 4708.057 | 4624.066 | 5932.895 | 3129.259 | 4426.143 | 4040.705 |
| 255 | 4191.273 | 3041.758 | 5305.814 | 5170.549 | 4750 | 5466.158 | 2360.166 | 4708.057 | 4624.066 | 5932.895 | 3126.665 | 4425.681 | 4040.705 |
| 256 | 4189.749 | 3038.309 | 5305.814 | 5170.549 | 4750 | 5466.158 | 2357.244 | 4708.057 | 4624.066 | 5932.895 | 3124.075 | 4425.219 | 4040.705 |
| 257 | 4188.227 | 3034.881 | 5305.814 | 5170.549 | 4750 | 5466.158 | 2354.34 | 4708.057 | 4624.066 | 5932.895 | 3121.49 | 4424.296 | 4040.705 |
| 258 | 4186.705 | 3031.474 | 5305.814 | 5170.549 | 4750 | 5466.158 | 2351.455 | 4708.057 | 4624.066 | 5932.895 | 3119.123 | 4423.834 | 4040.705 |
| 259 | 4185.185 | 3028.087 | 5305.814 | 5170.549 | 4750 | 5466.158 | 2348.588 | 4708.057 | 4624.066 | 5932.895 | 3116.546 | 4423.372 | 4040.705 |
| 260 | 4183.666 | 3024.721 | 5305.814 | 5170.549 | 4750 | 5466.158 | 2345.739 | 4708.057 | 4624.066 | 5932.895 | 3114.187 | 4422.911 | 4040.705 |
| 261 | 4182.527 | 3021.375 | 5305.814 | 5170.549 | 4750 | 5466.158 | 2342.907 | 4708.057 | 4624.066 | 5932.895 | 3111.618 | 4421.988 | 4040.705 |
| 262 | 4181.01 | 3018.05 | 5305.814 | 5170.549 | 4750 | 5466.158 | 2340.093 | 4708.057 | 4624.066 | 5932.895 | 3109.267 | 4421.527 | 4040.705 |
| 263 | 4179.494 | 3014.744 | 5305.814 | 5170.549 | 4750 | 5466.158 | 2337.297 | 4708.057 | 4624.066 | 5932.895 | 3106.919 | 4421.066 | 4040.705 |
| 264 | 4177.979 | 3011.458 | 5305.814 | 5170.549 | 4750 | 5466.158 | 2334.517 | 4708.057 | 4624.066 | 5932.895 | 3104.575 | 4420.144 | 4040.705 |
| 265 | 4176.844 | 3008.192 | 5305.814 | 5170.549 | 4750 | 5466.158 | 2331.755 | 4708.057 | 4624.066 | 5932.895 | 3102.234 | 4419.683 | 4040.705 |
| 266 | 4175.331 | 3004.944 | 5305.814 | 5170.549 | 4750 | 5466.158 | 2329.01 | 4708.057 | 4624.066 | 5932.895 | 3099.897 | 4419.222 | 4040.705 |
| 267 | 4173.819 | 3001.716 | 5305.814 | 5170.549 | 4750 | 5466.158 | 2326.281 | 4708.057 | 4624.066 | 5932.895 | 3097.776 | 4418.762 | 4040.705 |
| 268 | 4172.308 | 2998.507 | 5305.814 | 5170.549 | 4750 | 5466.158 | 2323.569 | 4708.057 | 4624.066 | 5932.895 | 3095.445 | 4418.301 | 4040.705 |
| 269 | 4171.175 | 2995.317 | 5305.814 | 5170.549 | 4750 | 5466.158 | 2320.873 | 4708.057 | 4624.066 | 5932.895 | 3093.33 | 4417.38 | 4040.705 |
| 270 | 4169.666 | 2992.145 | 5305.814 | 5170.549 | 4750 | 5466.158 | 2318.193 | 4708.057 | 4624.066 | 5932.895 | 3091.217 | 4416.92 | 4040.705 |
| 271 | 4168.158 | 2988.991 | 5305.814 | 5170.549 | 4750 | 5466.158 | 2315.53 | 4708.057 | 4624.066 | 5932.895 | 3089.107 | 4416.46 | 4040.705 |
| 272 | 4167.028 | 2985.856 | 5305.814 | 5170.549 | 4750 | 5466.158 | 2312.882 | 4708.057 | 4624.066 | 5932.895 | 3087 | 4416 | 4040.705 |
| 273 | 4165.522 | 2982.738 | 5305.814 | 5170.549 | 4750 | 5466.158 | 2310.25 | 4708.057 | 4624.066 | 5932.895 | 3084.896 | 4415.08 | 4040.705 |
| 274 | 4164.017 | 2979.639 | 5305.814 | 5170.549 | 4750 | 5466.158 | 2307.633 | 4708.057 | 4624.066 | 5932.895 | 3083.005 | 4414.62 | 4040.705 |
| 275 | 4162.889 | 2976.557 | 5305.814 | 5170.549 | 4750 | 5466.158 | 2305.032 | 4708.057 | 4624.066 | 5932.895 | 3081.116 | 4414.161 | 4040.705 |
| 276 | 4161.386 | 2973.492 | 5305.814 | 5170.549 | 4750 | 5466.158 | 2302.446 | 4708.057 | 4624.066 | 5932.895 | 3079.23 | 4413.701 | 4040.705 |
| 277 | 4159.885 | 2970.445 | 5305.814 | 5170.549 | 4750 | 5466.158 | 2299.875 | 4708.057 | 4624.066 | 5932.895 | 3077.346 | 4413.242 | 4040.705 |
| 278 | 4158.759 | 2967.415 | 5305.814 | 5170.549 | 4750 | 5466.158 | 2297.319 | 4708.057 | 4624.066 | 5932.895 | 3075.673 | 4412.323 | 4040.705 |
| 279 | 4157.259 | 2964.402 | 5305.814 | 5170.549 | 4750 | 5466.158 | 2294.778 | 4708.057 | 4624.066 | 5932.895 | 3074.002 | 4411.864 | 4040.705 |
| 280 | 4156.134 | 2961.406 | 5305.814 | 5170.549 | 4750 | 5466.158 | 2292.252 | 4708.057 | 4624.066 | 5932.895 | 3072.332 | 4411.405 | 4040.705 |
| 281 | 4154.636 | 2958.426 | 5305.814 | 5170.549 | 4750 | 5466.158 | 2289.74 | 4708.057 | 4624.066 | 5932.895 | 3070.873 | 4410.946 | 4040.705 |
| 282 | 4153.514 | 2955.463 | 5305.814 | 5170.549 | 4750 | 5466.158 | 2287.242 | 4708.057 | 4624.066 | 5932.895 | 3069.415 | 4410.487 | 4040.705 |
| 283 | 4152.017 | 2952.517 | 5305.814 | 5170.549 | 4750 | 5466.158 | 2284.758 | 4708.057 | 4624.066 | 5932.895 | 3067.959 | 4409.569 | 4040.705 |
| 284 | 4150.896 | 2949.586 | 5305.814 | 5170.549 | 4750 | 5466.158 | 2282.289 | 4708.057 | 4624.066 | 5932.895 | 3066.712 | 4409.111 | 4040.705 |
| 285 | 4149.401 | 2946.672 | 5305.814 | 5170.549 | 4750 | 5466.158 | 2279.834 | 4708.057 | 4624.066 | 5932.895 | 3065.466 | 4408.652 | 4040.705 |
| 286 | 4148.281 | 2943.773 | 5305.814 | 5170.549 | 4750 | 5466.158 | 2277.392 | 4708.057 | 4624.066 | 5932.895 | 3064.22 | 4408.194 | 4040.705 |
| 287 | 4146.789 | 2940.89 | 5305.814 | 5170.549 | 4750 | 5466.158 | 2274.964 | 4708.057 | 4624.066 | 5932.895 | 3063.184 | 4407.735 | 4040.705 |
| 288 | 4145.67 | 2938.023 | 5305.814 | 5170.549 | 4750 | 5466.158 | 2272.55 | 4708.057 | 4624.066 | 5932.895 | 3062.147 | 4407.277 | 4040.705 |
| 289 | 4144.18 | 2935.172 | 5305.814 | 5170.549 | 4750 | 5466.158 | 2270.149 | 4708.057 | 4624.066 | 5932.895 | 3061.319 | 4406.361 | 4040.705 |
| 290 | 4143.063 | 2932.335 | 5305.814 | 5170.549 | 4750 | 5466.158 | 2267.762 | 4708.057 | 4624.066 | 5932.895 | 3060.491 | 4405.903 | 4040.705 |
| 291 | 4141.574 | 2929.514 | 5305.814 | 5170.549 | 4750 | 5466.158 | 2265.387 | 4708.057 | 4624.066 | 5932.895 | 3059.87 | 4405.445 | 4040.705 |
| 292 | 4140.458 | 2926.708 | 5305.814 | 5170.549 | 4750 | 5466.158 | 2263.026 | 4708.057 | 4624.066 | 5932.895 | 3059.25 | 4404.988 | 4040.705 |
| 293 | 4138.971 | 2923.916 | 5305.814 | 5170.549 | 4750 | 5466.158 | 2260.678 | 4708.057 | 4624.066 | 5932.895 | 3058.836 | 4404.53 | 4040.705 |
| 294 | 4137.857 | 2921.14 | 5305.814 | 5170.549 | 4750 | 5466.158 | 2258.342 | 4708.057 | 4624.066 | 5932.895 | 3058.423 | 4404.072 | 4040.705 |
| 295 | 4136.743 | 2918.378 | 5305.814 | 5170.549 | 4750 | 5466.158 | 2256.019 | 4708.057 | 4624.066 | 5932.895 | 3058.216 | 4403.615 | 4040.705 |
| 296 | 4135.259 | 2915.631 | 5305.814 | 5170.549 | 4750 | 5466.158 | 2253.709 | 4708.057 | 4624.066 | 5932.895 | 3058.01 | 4403.157 | 4040.705 |
| 297 | 4134.146 | 2912.898 | 5305.814 | 5170.549 | 4750 | 5466.158 | 2251.411 | 4708.057 | 4624.066 | 5932.895 | 3058.01 | 4402.243 | 4040.705 |
| 298 | 4133.035 | 2910.179 | 5305.814 | 5170.549 | 4750 | 5466.158 | 2249.126 | 4708.057 | 4624.066 | 5932.895 | 3058.01 | 4401.786 | 4040.705 |
| 299 | 4131.553 | 2907.474 | 5305.814 | 5170.549 | 4750 | 5466.158 | 2246.852 | 4708.057 | 4624.066 | 5932.895 | 3058.01 | 4401.329 | 4040.705 |
| 300 | 4130.443 | 2904.784 | 5305.814 | 5170.549 | 4750 | 5466.158 | 2246.852 | 4708.057 | 4624.066 | 5932.895 | 3058.01 | 4400.872 | 4040.705 |
| 301 | 4129.333 | 2902.107 | 5305.814 | 5170.549 | 4750 | 5466.158 | 2246.852 | 4708.057 | 4624.066 | 5932.895 | 3058.01 | 4400.415 | 4040.705 |
| 302 | 4127.854 | 2899.444 | 5305.814 | 5170.549 | 4750 | 5466.158 | 2246.852 | 4708.057 | 4624.066 | 5932.895 | 3058.01 | 4399.958 | 4040.705 |
| 303 | 4126.745 | 2896.795 | 5305.814 | 5170.549 | 4750 | 5466.158 | 2246.852 | 4708.057 | 4624.066 | 5932.895 | 3058.01 | 4399.502 | 4040.705 |
| 304 | 4125.638 | 2894.159 | 5305.814 | 5170.549 | 4750 | 5466.158 | 2246.852 | 4708.057 | 4624.066 | 5932.895 | 3058.01 | 4399.045 | 4040.705 |
| 305 | 4124.161 | 2891.536 | 5305.814 | 5170.549 | 4750 | 5466.158 | 2246.852 | 4708.057 | 4624.066 | 5932.895 | 3058.01 | 4398.589 | 4040.705 |
| 306 | 4123.055 | 2888.927 | 5305.814 | 5170.549 | 4750 | 5466.158 | 2246.852 | 4708.057 | 4624.066 | 5932.895 | 3058.01 | 4397.676 | 4040.705 |
| 307 | 4121.949 | 2886.331 | 5305.814 | 5170.549 | 4750 | 5466.158 | 2246.852 | 4708.057 | 4624.066 | 5932.895 | 3058.01 | 4397.22 | 4040.705 |
| 308 | 4120.844 | 2883.748 | 5305.814 | 5170.549 | 4750 | 5466.158 | 2246.852 | 4708.057 | 4624.066 | 5932.895 | 3058.01 | 4396.764 | 4040.705 |
| 309 | 4119.371 | 2881.178 | 5305.814 | 5170.549 | 4750 | 5466.158 | 2246.852 | 4708.057 | 4624.066 | 5932.895 | 3058.01 | 4396.308 | 4040.705 |
| 310 | 4118.267 | 2878.621 | 5305.814 | 5170.549 | 4750 | 5466.158 | 2246.852 | 4708.057 | 4624.066 | 5932.895 | 3058.01 | 4395.852 | 4040.705 |
| 311 | 4117.164 | 2876.077 | 5305.814 | 5170.549 | 4750 | 5466.158 | 2246.852 | 4708.057 | 4624.066 | 5932.895 | 3058.01 | 4395.397 | 4040.705 |
| 312 | 4116.061 | 2873.545 | 5305.814 | 5170.549 | 4750 | 5466.158 | 2246.852 | 4708.057 | 4624.066 | 5932.895 | 3058.01 | 4394.941 | 4040.705 |
| 313 | 4114.959 | 2871.025 | 5305.814 | 5170.549 | 4750 | 5466.158 | 2246.852 | 4708.057 | 4624.066 | 5932.895 | 3058.01 | 4394.485 | 4040.705 |
| 314 | 4113.49 | 2868.519 | 5305.814 | 5170.549 | 4750 | 5466.158 | 2246.852 | 4708.057 | 4624.066 | 5932.895 | 3058.01 | 4394.03 | 4040.705 |
| 315 | 4112.39 | 2866.024 | 5305.814 | 5170.549 | 4750 | 5466.158 | 2246.852 | 4708.057 | 4624.066 | 5932.895 | 3058.01 | 4393.574 | 4040.705 |
| 316 | 4111.289 | 2863.542 | 5305.814 | 5170.549 | 4750 | 5466.158 | 2246.852 | 4708.057 | 4624.066 | 5932.895 | 3058.01 | 4393.119 | 4040.705 |
| 317 | 4110.19 | 2861.071 | 5305.814 | 5170.549 | 4750 | 5466.158 | 2246.852 | 4708.057 | 4624.066 | 5932.895 | 3058.01 | 4392.664 | 4040.705 |
| 318 | 4109.091 | 2858.613 | 5305.814 | 5170.549 | 4750 | 5466.158 | 2246.852 | 4708.057 | 4624.066 | 5932.895 | 3058.01 | 4392.209 | 4040.705 |
| 319 | 4107.993 | 2856.166 | 5305.814 | 5170.549 | 4750 | 5466.158 | 2246.852 | 4708.057 | 4624.066 | 5932.895 | 3058.01 | 4391.754 | 4040.705 |
| 320 | 4106.895 | 2853.732 | 5305.814 | 5170.549 | 4750 | 5466.158 | 2246.852 | 4708.057 | 4624.066 | 5932.895 | 3058.01 | 4391.299 | 4040.705 |
| 321 | 4105.432 | 2851.309 | 5305.814 | 5170.549 | 4750 | 5466.158 | 2246.852 | 4708.057 | 4624.066 | 5932.895 | 3058.01 | 4390.844 | 4040.705 |
| 322 | 4104.335 | 2848.897 | 5305.814 | 5170.549 | 4750 | 5466.158 | 2246.852 | 4708.057 | 4624.066 | 5932.895 | 3058.01 | 4390.389 | 4040.705 |
| 323 | 4103.24 | 2846.498 | 5305.814 | 5170.549 | 4750 | 5466.158 | 2246.852 | 4708.057 | 4624.066 | 5932.895 | 3058.01 | 4389.935 | 4040.705 |
| 324 | 4102.144 | 2844.109 | 5305.814 | 5170.549 | 4750 | 5466.158 | 2246.852 | 4708.057 | 4624.066 | 5932.895 | 3058.01 | 4389.48 | 4040.705 |
| 325 | 4101.05 | 2841.732 | 5305.814 | 5170.549 | 4750 | 5466.158 | 2246.852 | 4708.057 | 4624.066 | 5932.895 | 3058.01 | 4388.571 | 4040.705 |
| 326 | 4099.956 | 2839.366 | 5305.814 | 5170.549 | 4750 | 5466.158 | 2246.852 | 4708.057 | 4624.066 | 5932.895 | 3058.01 | 4388.117 | 4040.705 |
| 327 | 4098.862 | 2837.012 | 5305.814 | 5170.549 | 4750 | 5466.158 | 2246.852 | 4708.057 | 4624.066 | 5932.895 | 3058.01 | 4387.663 | 4040.705 |
| 328 | 4097.769 | 2834.668 | 5305.814 | 5170.549 | 4750 | 5466.158 | 2246.852 | 4708.057 | 4624.066 | 5932.895 | 3058.01 | 4387.209 | 4040.705 |
| 329 | 4096.677 | 2832.335 | 5305.814 | 5170.549 | 4750 | 5466.158 | 2246.852 | 4708.057 | 4624.066 | 5932.895 | 3058.01 | 4386.755 | 4040.705 |
| 330 | 4095.585 | 2830.013 | 5305.814 | 5170.549 | 4750 | 5466.158 | 2246.852 | 4708.057 | 4624.066 | 5932.895 | 3058.01 | 4386.301 | 4040.705 |
| 331 | 4094.494 | 2827.702 | 5305.814 | 5170.549 | 4750 | 5466.158 | 2246.852 | 4708.057 | 4624.066 | 5932.895 | 3058.01 | 4385.847 | 4040.705 |
| 332 | 4093.403 | 2825.402 | 5305.814 | 5170.549 | 4750 | 5466.158 | 2246.852 | 4708.057 | 4624.066 | 5932.895 | 3058.01 | 4385.394 | 4040.705 |
| 333 | 4092.313 | 2823.112 | 5305.814 | 5170.549 | 4750 | 5466.158 | 2246.852 | 4708.057 | 4624.066 | 5932.895 | 3058.01 | 4384.94 | 4040.705 |
| 334 | 4091.224 | 2820.833 | 5305.814 | 5170.549 | 4750 | 5466.158 | 2246.852 | 4708.057 | 4624.066 | 5932.895 | 3058.01 | 4384.487 | 4040.705 |
| 335 | 4090.135 | 2818.564 | 5305.814 | 5170.549 | 4750 | 5466.158 | 2246.852 | 4708.057 | 4624.066 | 5932.895 | 3058.01 | 4384.033 | 4040.705 |
| 336 | 4089.047 | 2816.306 | 5305.814 | 5170.549 | 4750 | 5466.158 | 2246.852 | 4708.057 | 4624.066 | 5932.895 | 3058.01 | 4383.58 | 4040.705 |
| 337 | 4087.959 | 2814.058 | 5305.814 | 5170.549 | 4750 | 5466.158 | 2246.852 | 4708.057 | 4624.066 | 5932.895 | 3058.01 | 4383.127 | 4040.705 |
| 338 | 4086.872 | 2811.82 | 5305.814 | 5170.549 | 4750 | 5466.158 | 2246.852 | 4708.057 | 4624.066 | 5932.895 | 3058.01 | 4382.673 | 4040.705 |
| 339 | 4085.785 | 2809.593 | 5305.814 | 5170.549 | 4750 | 5466.158 | 2246.852 | 4708.057 | 4624.066 | 5932.895 | 3058.01 | 4382.22 | 4040.705 |
| 340 | 4084.699 | 2807.375 | 5305.814 | 5170.549 | 4750 | 5466.158 | 2246.852 | 4708.057 | 4624.066 | 5932.895 | 3058.01 | 4382.22 | 4040.705 |
| 341 | 4083.614 | 2805.167 | 5305.814 | 5170.549 | 4750 | 5466.158 | 2246.852 | 4708.057 | 4624.066 | 5932.895 | 3058.01 | 4381.767 | 4040.705 |
| 342 | 4082.529 | 2802.969 | 5305.814 | 5170.549 | 4750 | 5466.158 | 2246.852 | 4708.057 | 4624.066 | 5932.895 | 3058.01 | 4381.315 | 4040.705 |
| 343 | 4081.445 | 2800.781 | 5305.814 | 5170.549 | 4750 | 5466.158 | 2246.852 | 4708.057 | 4624.066 | 5932.895 | 3058.01 | 4380.862 | 4040.705 |
| 344 | 4080.361 | 2798.603 | 5305.814 | 5170.549 | 4750 | 5466.158 | 2246.852 | 4708.057 | 4624.066 | 5932.895 | 3058.01 | 4380.409 | 4040.705 |
| 345 | 4079.639 | 2796.435 | 5305.814 | 5170.549 | 4750 | 5466.158 | 2246.852 | 4708.057 | 4624.066 | 5932.895 | 3058.01 | 4379.957 | 4040.705 |
| 346 | 4078.556 | 2794.276 | 5305.814 | 5170.549 | 4750 | 5466.158 | 2246.852 | 4708.057 | 4624.066 | 5932.895 | 3058.01 | 4379.504 | 4040.705 |
| 347 | 4077.474 | 2792.126 | 5305.814 | 5170.549 | 4750 | 5466.158 | 2246.852 | 4708.057 | 4624.066 | 5932.895 | 3058.01 | 4379.052 | 4040.705 |
| 348 | 4076.393 | 2789.986 | 5305.814 | 5170.549 | 4750 | 5466.158 | 2246.852 | 4708.057 | 4624.066 | 5932.895 | 3058.01 | 4378.599 | 4040.705 |
| 349 | 4075.312 | 2787.856 | 5305.814 | 5170.549 | 4750 | 5466.158 | 2246.852 | 4708.057 | 4624.066 | 5932.895 | 3058.01 | 4378.147 | 4040.705 |
| 350 | 4074.231 | 2785.735 | 5305.814 | 5170.549 | 4750 | 5466.158 | 2246.852 | 4708.057 | 4624.066 | 5932.895 | 3058.01 | 4377.695 | 4040.705 |
| 351 | 4073.151 | 2783.623 | 5305.814 | 5170.549 | 4750 | 5466.158 | 2246.852 | 4708.057 | 4624.066 | 5932.895 | 3058.01 | 4377.243 | 4040.705 |
| 352 | 4072.432 | 2781.52 | 5305.814 | 5170.549 | 4750 | 5466.158 | 2246.852 | 4708.057 | 4624.066 | 5932.895 | 3058.01 | 4376.791 | 4040.705 |
| 353 | 4071.353 | 2779.426 | 5305.814 | 5170.549 | 4750 | 5466.158 | 2246.852 | 4708.057 | 4624.066 | 5932.895 | 3058.01 | 4376.339 | 4040.705 |
| 354 | 4070.275 | 2777.342 | 5305.814 | 5170.549 | 4750 | 5466.158 | 2246.852 | 4708.057 | 4624.066 | 5932.895 | 3058.01 | 4375.888 | 4040.705 |
| 355 | 4069.197 | 2775.266 | 5305.814 | 5170.549 | 4750 | 5466.158 | 2246.852 | 4708.057 | 4624.066 | 5932.895 | 3058.01 | 4375.436 | 4040.705 |
| 356 | 4068.12 | 2773.199 | 5305.814 | 5170.549 | 4750 | 5466.158 | 2246.852 | 4708.057 | 4624.066 | 5932.895 | 3058.01 | 4374.985 | 4040.705 |
| 357 | 4067.043 | 2771.141 | 5305.814 | 5170.549 | 4750 | 5466.158 | 2246.852 | 4708.057 | 4624.066 | 5932.895 | 3058.01 | 4374.533 | 4040.705 |
| 358 | 4066.326 | 2769.092 | 5305.814 | 5170.549 | 4750 | 5466.158 | 2246.852 | 4708.057 | 4624.066 | 5932.895 | 3058.01 | 4374.082 | 4040.705 |
| 359 | 4065.25 | 2767.052 | 5305.814 | 5170.549 | 4750 | 5466.158 | 2246.852 | 4708.057 | 4624.066 | 5932.895 | 3058.01 | 4373.63 | 4040.705 |
| 360 | 4064.175 | 2765.02 | 5305.814 | 5170.549 | 4750 | 5466.158 | 2246.852 | 4708.057 | 4624.066 | 5932.895 | 3058.01 | 4373.63 | 4040.705 |
| 361 | 4063.1 | 2762.997 | 5305.814 | 5170.549 | 4750 | 5466.158 | 2246.852 | 4708.057 | 4624.066 | 5932.895 | 3058.01 | 4373.179 | 4040.705 |
| 362 | 4062.384 | 2760.982 | 5305.814 | 5170.549 | 4750 | 5466.158 | 2246.852 | 4708.057 | 4624.066 | 5932.895 | 3058.01 | 4372.728 | 4040.705 |
| 363 | 4061.311 | 2758.976 | 5305.814 | 5170.549 | 4750 | 5466.158 | 2246.852 | 4708.057 | 4624.066 | 5932.895 | 3058.01 | 4372.277 | 4040.705 |
| 364 | 4060.238 | 2756.978 | 5305.814 | 5170.549 | 4750 | 5466.158 | 2246.852 | 4708.057 | 4624.066 | 5932.895 | 3058.01 | 4371.826 | 4040.705 |
| 365 | 4059.165 | 2754.988 | 5305.814 | 5170.549 | 4750 | 5466.158 | 2246.852 | 4708.057 | 4624.066 | 5932.895 | 3058.01 | 4371.376 | 4040.705 |
| 366 | 4058.451 | 2753.007 | 5305.814 | 5170.549 | 4750 | 5466.158 | 2246.852 | 4708.057 | 4624.066 | 5932.895 | 3058.01 | 4370.925 | 4040.705 |
| 367 | 4057.379 | 2751.034 | 5305.814 | 5170.549 | 4750 | 5466.158 | 2246.852 | 4708.057 | 4624.066 | 5932.895 | 3058.01 | 4370.474 | 4040.705 |
| 368 | 4056.308 | 2749.07 | 5305.814 | 5170.549 | 4750 | 5466.158 | 2246.852 | 4708.057 | 4624.066 | 5932.895 | 3058.01 | 4370.024 | 4040.705 |
| 369 | 4055.238 | 2747.113 | 5305.814 | 5170.549 | 4750 | 5466.158 | 2246.852 | 4708.057 | 4624.066 | 5932.895 | 3058.01 | 4369.573 | 4040.705 |
| 370 | 4054.525 | 2745.164 | 5305.814 | 5170.549 | 4750 | 5466.158 | 2246.852 | 4708.057 | 4624.066 | 5932.895 | 3058.01 | 4369.123 | 4040.705 |
| 371 | 4053.455 | 2743.224 | 5305.814 | 5170.549 | 4750 | 5466.158 | 2246.852 | 4708.057 | 4624.066 | 5932.895 | 3058.01 | 4369.123 | 4040.705 |
| 372 | 4052.386 | 2741.291 | 5305.814 | 5170.549 | 4750 | 5466.158 | 2246.852 | 4708.057 | 4624.066 | 5932.895 | 3058.01 | 4368.673 | 4040.705 |
| 373 | 4051.674 | 2739.366 | 5305.814 | 5170.549 | 4750 | 5466.158 | 2246.852 | 4708.057 | 4624.066 | 5932.895 | 3058.01 | 4368.223 | 4040.705 |
| 374 | 4050.606 | 2737.449 | 5305.814 | 5170.549 | 4750 | 5466.158 | 2246.852 | 4708.057 | 4624.066 | 5932.895 | 3058.01 | 4367.773 | 4040.705 |
| 375 | 4049.539 | 2735.54 | 5305.814 | 5170.549 | 4750 | 5466.158 | 2246.852 | 4708.057 | 4624.066 | 5932.895 | 3058.01 | 4367.323 | 4040.705 |
| 376 | 4048.828 | 2733.639 | 5305.814 | 5170.549 | 4750 | 5466.158 | 2246.852 | 4708.057 | 4624.066 | 5932.895 | 3058.01 | 4366.873 | 4040.705 |
| 377 | 4047.761 | 2731.745 | 5305.814 | 5170.549 | 4750 | 5466.158 | 2246.852 | 4708.057 | 4624.066 | 5932.895 | 3058.01 | 4366.423 | 4040.705 |
| 378 | 4046.695 | 2729.859 | 5305.814 | 5170.549 | 4750 | 5466.158 | 2246.852 | 4708.057 | 4624.066 | 5932.895 | 3058.01 | 4365.973 | 4040.705 |
| 379 | 4045.985 | 2727.98 | 5305.814 | 5170.549 | 4750 | 5466.158 | 2246.852 | 4708.057 | 4624.066 | 5932.895 | 3058.01 | 4365.524 | 4040.705 |
| 380 | 4044.92 | 2726.109 | 5305.814 | 5170.549 | 4750 | 5466.158 | 2246.852 | 4708.057 | 4624.066 | 5932.895 | 3058.01 | 4365.524 | 4040.705 |
| 381 | 4044.211 | 2724.245 | 5305.814 | 5170.549 | 4750 | 5466.158 | 2246.852 | 4708.057 | 4624.066 | 5932.895 | 3058.01 | 4365.074 | 4040.705 |
| 382 | 4043.147 | 2722.389 | 5305.814 | 5170.549 | 4750 | 5466.158 | 2246.852 | 4708.057 | 4624.066 | 5932.895 | 3058.01 | 4364.625 | 4040.705 |
| 383 | 4042.083 | 2720.54 | 5305.814 | 5170.549 | 4750 | 5466.158 | 2246.852 | 4708.057 | 4624.066 | 5932.895 | 3058.01 | 4364.175 | 4040.705 |
| 384 | 4041.374 | 2718.699 | 5305.814 | 5170.549 | 4750 | 5466.158 | 2246.852 | 4708.057 | 4624.066 | 5932.895 | 3058.01 | 4363.726 | 4040.705 |
| 385 | 4040.312 | 2716.864 | 5305.814 | 5170.549 | 4750 | 5466.158 | 2246.852 | 4708.057 | 4624.066 | 5932.895 | 3058.01 | 4363.277 | 4040.705 |
| 386 | 4039.604 | 2715.037 | 5305.814 | 5170.549 | 4750 | 5466.158 | 2246.852 | 4708.057 | 4624.066 | 5932.895 | 3058.01 | 4362.828 | 4040.705 |
| 387 | 4038.542 | 2713.217 | 5305.814 | 5170.549 | 4750 | 5466.158 | 2246.852 | 4708.057 | 4624.066 | 5932.895 | 3058.01 | 4362.828 | 4040.705 |
| 388 | 4037.481 | 2711.405 | 5305.814 | 5170.549 | 4750 | 5466.158 | 2246.852 | 4708.057 | 4624.066 | 5932.895 | 3058.01 | 4362.379 | 4040.705 |
| 389 | 4036.774 | 2709.599 | 5305.814 | 5170.549 | 4750 | 5466.158 | 2246.852 | 4708.057 | 4624.066 | 5932.895 | 3058.01 | 4361.93 | 4040.705 |
| 390 | 4035.714 | 2707.8 | 5305.814 | 5170.549 | 4750 | 5466.158 | 2246.852 | 4708.057 | 4624.066 | 5932.895 | 3058.01 | 4361.481 | 4040.705 |
| 391 | 4035.008 | 2706.008 | 5305.814 | 5170.549 | 4750 | 5466.158 | 2246.852 | 4708.057 | 4624.066 | 5932.895 | 3058.01 | 4361.033 | 4040.705 |
| 392 | 4033.949 | 2704.223 | 5305.814 | 5170.549 | 4750 | 5466.158 | 2246.852 | 4708.057 | 4624.066 | 5932.895 | 3058.01 | 4360.584 | 4040.705 |
| 393 | 4033.243 | 2702.446 | 5305.814 | 5170.549 | 4750 | 5466.158 | 2246.852 | 4708.057 | 4624.066 | 5932.895 | 3058.01 | 4360.136 | 4040.705 |
| 394 | 4032.185 | 2700.674 | 5305.814 | 5170.549 | 4750 | 5466.158 | 2246.852 | 4708.057 | 4624.066 | 5932.895 | 3058.01 | 4360.136 | 4040.705 |
| 395 | 4031.48 | 2698.91 | 5305.814 | 5170.549 | 4750 | 5466.158 | 2246.852 | 4708.057 | 4624.066 | 5932.895 | 3058.01 | 4359.687 | 4040.705 |
| 396 | 4030.422 | 2697.152 | 5305.814 | 5170.549 | 4750 | 5466.158 | 2246.852 | 4708.057 | 4624.066 | 5932.895 | 3058.01 | 4359.239 | 4040.705 |
| 397 | 4029.718 | 2695.402 | 5305.814 | 5170.549 | 4750 | 5466.158 | 2246.852 | 4708.057 | 4624.066 | 5932.895 | 3058.01 | 4358.791 | 4040.705 |
| 398 | 4028.661 | 2693.657 | 5305.814 | 5170.549 | 4750 | 5466.158 | 2246.852 | 4708.057 | 4624.066 | 5932.895 | 3058.01 | 4358.343 | 4040.705 |
| 399 | 4027.957 | 2691.92 | 5305.814 | 5170.549 | 4750 | 5466.158 | 2246.852 | 4708.057 | 4624.066 | 5932.895 | 3058.01 | 4357.895 | 4040.705 |
| 400 | 4026.902 | 2690.189 | 5305.814 | 5170.549 | 4750 | 5466.158 | 2246.852 | 4708.057 | 4624.066 | 5932.895 | 3058.01 | 4357.895 | 4040.705 |
| 401 | 4026.199 | 2688.464 | 5305.814 | 5170.549 | 4750 | 5466.158 | 2246.852 | 4708.057 | 4624.066 | 5932.895 | 3058.01 | 4357.447 | 4040.705 |
| 402 | 4025.144 | 2686.746 | 5305.814 | 5170.549 | 4750 | 5466.158 | 2246.852 | 4708.057 | 4624.066 | 5932.895 | 3058.01 | 4356.999 | 4040.705 |
| 403 | 4024.441 | 2685.035 | 5305.814 | 5170.549 | 4750 | 5466.158 | 2246.852 | 4708.057 | 4624.066 | 5932.895 | 3058.01 | 4356.551 | 4040.705 |
| 404 | 4023.388 | 2683.329 | 5305.814 | 5170.549 | 4750 | 5466.158 | 2246.852 | 4708.057 | 4624.066 | 5932.895 | 3058.01 | 4356.104 | 4040.705 |
| 405 | 4022.686 | 2681.631 | 5305.814 | 5170.549 | 4750 | 5466.158 | 2246.852 | 4708.057 | 4624.066 | 5932.895 | 3058.01 | 4355.656 | 4040.705 |
| 406 | 4021.633 | 2679.938 | 5305.814 | 5170.549 | 4750 | 5466.158 | 2246.852 | 4708.057 | 4624.066 | 5932.895 | 3058.01 | 4355.656 | 4040.705 |
| 407 | 4020.931 | 2678.252 | 5305.814 | 5170.549 | 4750 | 5466.158 | 2246.852 | 4708.057 | 4624.066 | 5932.895 | 3058.01 | 4355.209 | 4040.705 |
| 408 | 4019.88 | 2676.572 | 5305.814 | 5170.549 | 4750 | 5466.158 | 2246.852 | 4708.057 | 4624.066 | 5932.895 | 3058.01 | 4354.761 | 4040.705 |
| 409 | 4019.179 | 2674.898 | 5305.814 | 5170.549 | 4750 | 5466.158 | 2246.852 | 4708.057 | 4624.066 | 5932.895 | 3058.01 | 4354.314 | 4040.705 |
| 410 | 4018.128 | 2673.23 | 5305.814 | 5170.549 | 4750 | 5466.158 | 2246.852 | 4708.057 | 4624.066 | 5932.895 | 3058.01 | 4353.867 | 4040.705 |
| 411 | 4017.428 | 2671.569 | 5305.814 | 5170.549 | 4750 | 5466.158 | 2246.852 | 4708.057 | 4624.066 | 5932.895 | 3058.01 | 4353.867 | 4040.705 |
| 412 | 4016.728 | 2669.914 | 5305.814 | 5170.549 | 4750 | 5466.158 | 2246.852 | 4708.057 | 4624.066 | 5932.895 | 3058.01 | 4353.42 | 4040.705 |
| 413 | 4015.678 | 2668.264 | 5305.814 | 5170.549 | 4750 | 5466.158 | 2246.852 | 4708.057 | 4624.066 | 5932.895 | 3058.01 | 4352.973 | 4040.705 |
| 414 | 4014.979 | 2666.621 | 5305.814 | 5170.549 | 4750 | 5466.158 | 2246.852 | 4708.057 | 4624.066 | 5932.895 | 3058.01 | 4352.526 | 4040.705 |
| 415 | 4013.93 | 2664.983 | 5305.814 | 5170.549 | 4750 | 5466.158 | 2246.852 | 4708.057 | 4624.066 | 5932.895 | 3058.01 | 4352.079 | 4040.705 |
| 416 | 4013.231 | 2663.352 | 5305.814 | 5170.549 | 4750 | 5466.158 | 2246.852 | 4708.057 | 4624.066 | 5932.895 | 3058.01 | 4352.079 | 4040.705 |
| 417 | 4012.533 | 2661.726 | 5305.814 | 5170.549 | 4750 | 5466.158 | 2246.852 | 4708.057 | 4624.066 | 5932.895 | 3058.01 | 4351.632 | 4040.705 |
| 418 | 4011.485 | 2660.107 | 5305.814 | 5170.549 | 4750 | 5466.158 | 2246.852 | 4708.057 | 4624.066 | 5932.895 | 3058.01 | 4351.185 | 4040.705 |
| 419 | 4010.787 | 2658.493 | 5305.814 | 5170.549 | 4750 | 5466.158 | 2246.852 | 4708.057 | 4624.066 | 5932.895 | 3058.01 | 4350.739 | 4040.705 |
| 420 | 4009.741 | 2656.885 | 5305.814 | 5170.549 | 4750 | 5466.158 | 2246.852 | 4708.057 | 4624.066 | 5932.895 | 3058.01 | 4350.292 | 4040.705 |
| 421 | 4009.043 | 2655.282 | 5305.814 | 5170.549 | 4750 | 5466.158 | 2246.852 | 4708.057 | 4624.066 | 5932.895 | 3058.01 | 4350.292 | 4040.705 |
| 422 | 4008.346 | 2653.686 | 5305.814 | 5170.549 | 4750 | 5466.158 | 2246.852 | 4708.057 | 4624.066 | 5932.895 | 3058.01 | 4349.846 | 4040.705 |
| 423 | 4007.301 | 2652.095 | 5305.814 | 5170.549 | 4750 | 5466.158 | 2246.852 | 4708.057 | 4624.066 | 5932.895 | 3058.01 | 4349.4 | 4040.705 |
| 424 | 4006.605 | 2650.51 | 5305.814 | 5170.549 | 4750 | 5466.158 | 2246.852 | 4708.057 | 4624.066 | 5932.895 | 3058.01 | 4348.954 | 4040.705 |
| 425 | 4005.908 | 2648.93 | 5305.814 | 5170.549 | 4750 | 5466.158 | 2246.852 | 4708.057 | 4624.066 | 5932.895 | 3058.01 | 4348.508 | 4040.705 |
| 426 | 4004.864 | 2647.356 | 5305.814 | 5170.549 | 4750 | 5466.158 | 2246.852 | 4708.057 | 4624.066 | 5932.895 | 3058.01 | 4348.508 | 4040.705 |
| 427 | 4004.169 | 2645.787 | 5305.814 | 5170.549 | 4750 | 5466.158 | 2246.852 | 4708.057 | 4624.066 | 5932.895 | 3058.01 | 4348.062 | 4040.705 |
| 428 | 4003.473 | 2644.224 | 5305.814 | 5170.549 | 4750 | 5466.158 | 2246.852 | 4708.057 | 4624.066 | 5932.895 | 3058.01 | 4347.616 | 4040.705 |
| 429 | 4002.431 | 2642.667 | 5305.814 | 5170.549 | 4750 | 5466.158 | 2246.852 | 4708.057 | 4624.066 | 5932.895 | 3058.01 | 4347.17 | 4040.705 |
| 430 | 4001.736 | 2641.115 | 5305.814 | 5170.549 | 4750 | 5466.158 | 2246.852 | 4708.057 | 4624.066 | 5932.895 | 3058.01 | 4347.17 | 4040.705 |
| 431 | 4001.041 | 2639.568 | 5305.814 | 5170.549 | 4750 | 5466.158 | 2246.852 | 4708.057 | 4624.066 | 5932.895 | 3058.01 | 4346.724 | 4040.705 |
| 432 | 4000 | 2638.027 | 5305.814 | 5170.549 | 4750 | 5466.158 | 2246.852 | 4708.057 | 4624.066 | 5932.895 | 3058.01 | 4346.278 | 4040.705 |
| 433 | 3999.306 | 2636.491 | 5305.814 | 5170.549 | 4750 | 5466.158 | 2246.852 | 4708.057 | 4624.066 | 5932.895 | 3058.01 | 4345.833 | 4040.705 |
| 434 | 3998.612 | 2634.96 | 5305.814 | 5170.549 | 4750 | 5466.158 | 2246.852 | 4708.057 | 4624.066 | 5932.895 | 3058.01 | 4345.387 | 4040.705 |
| 435 | 3997.572 | 2633.435 | 5305.814 | 5170.549 | 4750 | 5466.158 | 2246.852 | 4708.057 | 4624.066 | 5932.895 | 3058.01 | 4345.387 | 4040.705 |
| 436 | 3996.879 | 2631.914 | 5305.814 | 5170.549 | 4750 | 5466.158 | 2246.852 | 4708.057 | 4624.066 | 5932.895 | 3058.01 | 4344.942 | 4040.705 |
| 437 | 3996.186 | 2630.4 | 5305.814 | 5170.549 | 4750 | 5466.158 | 2246.852 | 4708.057 | 4624.066 | 5932.895 | 3058.01 | 4344.497 | 4040.705 |
| 438 | 3995.494 | 2628.89 | 5305.814 | 5170.549 | 4750 | 5466.158 | 2246.852 | 4708.057 | 4624.066 | 5932.895 | 3058.01 | 4344.052 | 4040.705 |
| 439 | 3994.455 | 2627.385 | 5305.814 | 5170.549 | 4750 | 5466.158 | 2246.852 | 4708.057 | 4624.066 | 5932.895 | 3058.01 | 4344.052 | 4040.705 |
| 440 | 3993.763 | 2625.886 | 5305.814 | 5170.549 | 4750 | 5466.158 | 2246.852 | 4708.057 | 4624.066 | 5932.895 | 3058.01 | 4343.607 | 4040.705 |
| 441 | 3993.071 | 2624.392 | 5305.814 | 5170.549 | 4750 | 5466.158 | 2246.852 | 4708.057 | 4624.066 | 5932.895 | 3058.01 | 4343.162 | 4040.705 |
| 442 | 3992.034 | 2622.902 | 5305.814 | 5170.549 | 4750 | 5466.158 | 2246.852 | 4708.057 | 4624.066 | 5932.895 | 3058.01 | 4342.717 | 4040.705 |
| 443 | 3991.343 | 2621.418 | 5305.814 | 5170.549 | 4750 | 5466.158 | 2246.852 | 4708.057 | 4624.066 | 5932.895 | 3058.01 | 4342.717 | 4040.705 |
| 444 | 3990.652 | 2619.939 | 5305.814 | 5170.549 | 4750 | 5466.158 | 2246.852 | 4708.057 | 4624.066 | 5932.895 | 3058.01 | 4342.272 | 4040.705 |
| 445 | 3989.961 | 2618.465 | 5305.814 | 5170.549 | 4750 | 5466.158 | 2246.852 | 4708.057 | 4624.066 | 5932.895 | 3058.01 | 4341.827 | 4040.705 |
| 446 | 3988.925 | 2616.995 | 5305.814 | 5170.549 | 4750 | 5466.158 | 2246.852 | 4708.057 | 4624.066 | 5932.895 | 3058.01 | 4341.382 | 4040.705 |
| 447 | 3988.235 | 2615.531 | 5305.814 | 5170.549 | 4750 | 5466.158 | 2246.852 | 4708.057 | 4624.066 | 5932.895 | 3058.01 | 4341.382 | 4040.705 |
| 448 | 3987.545 | 2614.072 | 5305.814 | 5170.549 | 4750 | 5466.158 | 2246.852 | 4708.057 | 4624.066 | 5932.895 | 3058.01 | 4340.938 | 4040.705 |
| 449 | 3986.856 | 2612.617 | 5305.814 | 5170.549 | 4750 | 5466.158 | 2246.852 | 4708.057 | 4624.066 | 5932.895 | 3058.01 | 4340.493 | 4040.705 |
| 450 | 3986.166 | 2611.167 | 5305.814 | 5170.549 | 4750 | 5466.158 | 2246.852 | 4708.057 | 4624.066 | 5932.895 | 3058.01 | 4340.049 | 4040.705 |
| 451 | 3985.133 | 2609.723 | 5305.814 | 5170.549 | 4750 | 5466.158 | 2246.852 | 4708.057 | 4624.066 | 5932.895 | 3058.01 | 4340.049 | 4040.705 |
| 452 | 3984.444 | 2608.282 | 5305.814 | 5170.549 | 4750 | 5466.158 | 2246.852 | 4708.057 | 4624.066 | 5932.895 | 3058.01 | 4339.605 | 4040.705 |
| 453 | 3983.755 | 2606.847 | 5305.814 | 5170.549 | 4750 | 5466.158 | 2246.852 | 4708.057 | 4624.066 | 5932.895 | 3058.01 | 4339.161 | 4040.705 |
| 454 | 3983.067 | 2605.416 | 5305.814 | 5170.549 | 4750 | 5466.158 | 2246.852 | 4708.057 | 4624.066 | 5932.895 | 3058.01 | 4338.717 | 4040.705 |
| 455 | 3982.379 | 2603.991 | 5305.814 | 5170.549 | 4750 | 5466.158 | 2246.852 | 4708.057 | 4624.066 | 5932.895 | 3058.01 | 4338.717 | 4040.705 |
| 456 | 3981.347 | 2602.569 | 5305.814 | 5170.549 | 4750 | 5466.158 | 2246.852 | 4708.057 | 4624.066 | 5932.895 | 3058.01 | 4338.273 | 4040.705 |
| 457 | 3980.66 | 2601.153 | 5305.814 | 5170.549 | 4750 | 5466.158 | 2246.852 | 4708.057 | 4624.066 | 5932.895 | 3058.01 | 4337.829 | 4040.705 |
| 458 | 3979.972 | 2599.741 | 5305.814 | 5170.549 | 4750 | 5466.158 | 2246.852 | 4708.057 | 4624.066 | 5932.895 | 3058.01 | 4337.829 | 4040.705 |
| 459 | 3979.285 | 2598.333 | 5305.814 | 5170.549 | 4750 | 5466.158 | 2246.852 | 4708.057 | 4624.066 | 5932.895 | 3058.01 | 4337.385 | 4040.705 |
| 460 | 3978.599 | 2596.931 | 5305.814 | 5170.549 | 4750 | 5466.158 | 2246.852 | 4708.057 | 4624.066 | 5932.895 | 3058.01 | 4336.941 | 4040.705 |
| 461 | 3977.569 | 2595.532 | 5305.814 | 5170.549 | 4750 | 5466.158 | 2246.852 | 4708.057 | 4624.066 | 5932.895 | 3058.01 | 4336.498 | 4040.705 |
| 462 | 3976.883 | 2594.139 | 5305.814 | 5170.549 | 4750 | 5466.158 | 2246.852 | 4708.057 | 4624.066 | 5932.895 | 3058.01 | 4336.498 | 4040.705 |
| 463 | 3976.197 | 2592.749 | 5305.814 | 5170.549 | 4750 | 5466.158 | 2246.852 | 4708.057 | 4624.066 | 5932.895 | 3058.01 | 4336.054 | 4040.705 |
| 464 | 3975.511 | 2591.365 | 5305.814 | 5170.549 | 4750 | 5466.158 | 2246.852 | 4708.057 | 4624.066 | 5932.895 | 3058.01 | 4335.611 | 4040.705 |
| 465 | 3974.825 | 2589.984 | 5305.814 | 5170.549 | 4750 | 5466.158 | 2246.852 | 4708.057 | 4624.066 | 5932.895 | 3058.01 | 4335.611 | 4040.705 |
| 466 | 3974.14 | 2588.609 | 5305.814 | 5170.549 | 4750 | 5466.158 | 2246.852 | 4708.057 | 4624.066 | 5932.895 | 3058.01 | 4335.167 | 4040.705 |
| 467 | 3973.455 | 2587.237 | 5305.814 | 5170.549 | 4750 | 5466.158 | 2246.852 | 4708.057 | 4624.066 | 5932.895 | 3058.01 | 4334.724 | 4040.705 |
| 468 | 3972.428 | 2585.87 | 5305.814 | 5170.549 | 4750 | 5466.158 | 2246.852 | 4708.057 | 4624.066 | 5932.895 | 3058.01 | 4334.281 | 4040.705 |
| 469 | 3971.744 | 2584.507 | 5305.814 | 5170.549 | 4750 | 5466.158 | 2246.852 | 4708.057 | 4624.066 | 5932.895 | 3058.01 | 4334.281 | 4040.705 |
| 470 | 3971.059 | 2583.149 | 5305.814 | 5170.549 | 4750 | 5466.158 | 2246.852 | 4708.057 | 4624.066 | 5932.895 | 3058.01 | 4333.838 | 4040.705 |
| 471 | 3970.375 | 2581.795 | 5305.814 | 5170.549 | 4750 | 5466.158 | 2246.852 | 4708.057 | 4624.066 | 5932.895 | 3058.01 | 4333.395 | 4040.705 |
| 472 | 3969.692 | 2580.445 | 5305.814 | 5170.549 | 4750 | 5466.158 | 2246.852 | 4708.057 | 4624.066 | 5932.895 | 3058.01 | 4333.395 | 4040.705 |
| 473 | 3969.008 | 2579.099 | 5305.814 | 5170.549 | 4750 | 5466.158 | 2246.852 | 4708.057 | 4624.066 | 5932.895 | 3058.01 | 4332.952 | 4040.705 |
| 474 | 3968.325 | 2577.758 | 5305.814 | 5170.549 | 4750 | 5466.158 | 2246.852 | 4708.057 | 4624.066 | 5932.895 | 3058.01 | 4332.509 | 4040.705 |
| 475 | 3967.642 | 2576.421 | 5305.814 | 5170.549 | 4750 | 5466.158 | 2246.852 | 4708.057 | 4624.066 | 5932.895 | 3058.01 | 4332.066 | 4040.705 |
| 476 | 3966.618 | 2575.088 | 5305.814 | 5170.549 | 4750 | 5466.158 | 2246.852 | 4708.057 | 4624.066 | 5932.895 | 3058.01 | 4332.066 | 4040.705 |
| 477 | 3965.935 | 2573.759 | 5305.814 | 5170.549 | 4750 | 5466.158 | 2246.852 | 4708.057 | 4624.066 | 5932.895 | 3058.01 | 4331.624 | 4040.705 |
| 478 | 3965.253 | 2572.434 | 5305.814 | 5170.549 | 4750 | 5466.158 | 2246.852 | 4708.057 | 4624.066 | 5932.895 | 3058.01 | 4331.181 | 4040.705 |
| 479 | 3964.571 | 2571.114 | 5305.814 | 5170.549 | 4750 | 5466.158 | 2246.852 | 4708.057 | 4624.066 | 5932.895 | 3058.01 | 4331.181 | 4040.705 |
| 480 | 3963.89 | 2569.797 | 5305.814 | 5170.549 | 4750 | 5466.158 | 2246.852 | 4708.057 | 4624.066 | 5932.895 | 3058.01 | 4330.739 | 4040.705 |
| 481 | 3963.208 | 2568.485 | 5305.814 | 5170.549 | 4750 | 5466.158 | 2246.852 | 4708.057 | 4624.066 | 5932.895 | 3058.01 | 4330.296 | 4040.705 |
| 482 | 3962.527 | 2567.177 | 5305.814 | 5170.549 | 4750 | 5466.158 | 2246.852 | 4708.057 | 4624.066 | 5932.895 | 3058.01 | 4330.296 | 4040.705 |
| 483 | 3961.846 | 2565.873 | 5305.814 | 5170.549 | 4750 | 5466.158 | 2246.852 | 4708.057 | 4624.066 | 5932.895 | 3058.01 | 4329.854 | 4040.705 |
| 484 | 3961.165 | 2564.572 | 5305.814 | 5170.549 | 4750 | 5466.158 | 2246.852 | 4708.057 | 4624.066 | 5932.895 | 3058.01 | 4329.412 | 4040.705 |
| 485 | 3960.484 | 2563.276 | 5305.814 | 5170.549 | 4750 | 5466.158 | 2246.852 | 4708.057 | 4624.066 | 5932.895 | 3058.01 | 4329.412 | 4040.705 |
| 486 | 3959.804 | 2561.984 | 5305.814 | 5170.549 | 4750 | 5466.158 | 2246.852 | 4708.057 | 4624.066 | 5932.895 | 3058.01 | 4328.97 | 4040.705 |
| 487 | 3959.124 | 2560.695 | 5305.814 | 5170.549 | 4750 | 5466.158 | 2246.852 | 4708.057 | 4624.066 | 5932.895 | 3058.01 | 4328.528 | 4040.705 |
| 488 | 3958.444 | 2559.411 | 5305.814 | 5170.549 | 4750 | 5466.158 | 2246.852 | 4708.057 | 4624.066 | 5932.895 | 3058.01 | 4328.086 | 4040.705 |
| 489 | 3957.765 | 2558.131 | 5305.814 | 5170.549 | 4750 | 5466.158 | 2246.852 | 4708.057 | 4624.066 | 5932.895 | 3058.01 | 4328.086 | 4040.705 |
| 490 | 3957.085 | 2556.854 | 5305.814 | 5170.549 | 4750 | 5466.158 | 2246.852 | 4708.057 | 4624.066 | 5932.895 | 3058.01 | 4327.644 | 4040.705 |
| 491 | 3956.406 | 2555.581 | 5305.814 | 5170.549 | 4750 | 5466.158 | 2246.852 | 4708.057 | 4624.066 | 5932.895 | 3058.01 | 4327.202 | 4040.705 |
| 492 | 3955.388 | 2554.312 | 5305.814 | 5170.549 | 4750 | 5466.158 | 2246.852 | 4708.057 | 4624.066 | 5932.895 | 3058.01 | 4327.202 | 4040.705 |
| 493 | 3954.709 | 2553.047 | 5305.814 | 5170.549 | 4750 | 5466.158 | 2246.852 | 4708.057 | 4624.066 | 5932.895 | 3058.01 | 4326.761 | 4040.705 |
| 494 | 3954.031 | 2551.786 | 5305.814 | 5170.549 | 4750 | 5466.158 | 2246.852 | 4708.057 | 4624.066 | 5932.895 | 3058.01 | 4326.319 | 4040.705 |
| 495 | 3953.353 | 2550.529 | 5305.814 | 5170.549 | 4750 | 5466.158 | 2246.852 | 4708.057 | 4624.066 | 5932.895 | 3058.01 | 4326.319 | 4040.705 |
| 496 | 3952.675 | 2549.275 | 5305.814 | 5170.549 | 4750 | 5466.158 | 2246.852 | 4708.057 | 4624.066 | 5932.895 | 3058.01 | 4325.878 | 4040.705 |
| 497 | 3951.997 | 2548.025 | 5305.814 | 5170.549 | 4750 | 5466.158 | 2246.852 | 4708.057 | 4624.066 | 5932.895 | 3058.01 | 4325.436 | 4040.705 |
| 498 | 3951.32 | 2546.779 | 5305.814 | 5170.549 | 4750 | 5466.158 | 2246.852 | 4708.057 | 4624.066 | 5932.895 | 3058.01 | 4325.436 | 4040.705 |
| 499 | 3950.643 | 2545.536 | 5305.814 | 5170.549 | 4750 | 5466.158 | 2246.852 | 4708.057 | 4624.066 | 5932.895 | 3058.01 | 4324.995 | 4040.705 |